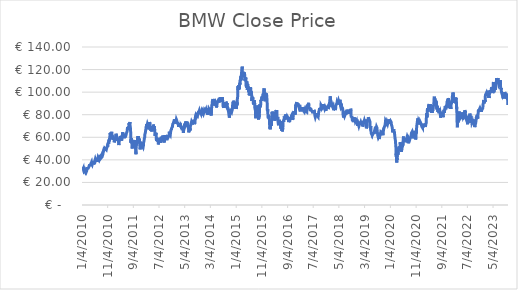
| Category | BMW Close Price |
|---|---|
| 1/4/10 | 32.05 |
| 1/5/10 | 32.31 |
| 1/6/10 | 32.81 |
| 1/7/10 | 33.1 |
| 1/8/10 | 32.655 |
| 1/11/10 | 32.17 |
| 1/12/10 | 31.235 |
| 1/13/10 | 31.425 |
| 1/14/10 | 31.89 |
| 1/15/10 | 31.63 |
| 1/18/10 | 32.1 |
| 1/19/10 | 32.43 |
| 1/20/10 | 31.8 |
| 1/21/10 | 31.155 |
| 1/22/10 | 30.7 |
| 1/25/10 | 30.14 |
| 1/26/10 | 30.255 |
| 1/27/10 | 29.59 |
| 1/28/10 | 29.55 |
| 1/29/10 | 30.96 |
| 2/1/10 | 31.065 |
| 2/2/10 | 31.175 |
| 2/3/10 | 31.225 |
| 2/4/10 | 30.335 |
| 2/5/10 | 29.92 |
| 2/8/10 | 29.61 |
| 2/9/10 | 29.625 |
| 2/10/10 | 29.665 |
| 2/11/10 | 29.49 |
| 2/12/10 | 29 |
| 2/15/10 | 28.65 |
| 2/16/10 | 29.405 |
| 2/17/10 | 29.615 |
| 2/18/10 | 29.415 |
| 2/19/10 | 30.435 |
| 2/22/10 | 30.26 |
| 2/23/10 | 29.69 |
| 2/24/10 | 29.485 |
| 2/25/10 | 29.375 |
| 2/26/10 | 29.785 |
| 3/1/10 | 30.445 |
| 3/2/10 | 31.34 |
| 3/3/10 | 31.65 |
| 3/4/10 | 31.56 |
| 3/5/10 | 32.365 |
| 3/8/10 | 31.99 |
| 3/9/10 | 32.13 |
| 3/10/10 | 32.265 |
| 3/11/10 | 32.69 |
| 3/12/10 | 32.54 |
| 3/15/10 | 32.64 |
| 3/16/10 | 32.755 |
| 3/17/10 | 32.47 |
| 3/18/10 | 32.105 |
| 3/19/10 | 32.06 |
| 3/22/10 | 32.5 |
| 3/23/10 | 33.15 |
| 3/24/10 | 33.375 |
| 3/25/10 | 34.04 |
| 3/26/10 | 34.2 |
| 3/29/10 | 34.115 |
| 3/30/10 | 33.785 |
| 3/31/10 | 34.18 |
| 4/1/10 | 35.155 |
| 4/6/10 | 35.41 |
| 4/7/10 | 34.8 |
| 4/8/10 | 34.53 |
| 4/9/10 | 34.86 |
| 4/12/10 | 35.12 |
| 4/13/10 | 35.35 |
| 4/14/10 | 35.515 |
| 4/15/10 | 35.33 |
| 4/16/10 | 35.56 |
| 4/19/10 | 35.31 |
| 4/20/10 | 36.795 |
| 4/21/10 | 36.58 |
| 4/22/10 | 36.25 |
| 4/23/10 | 37.28 |
| 4/26/10 | 37.82 |
| 4/27/10 | 37.06 |
| 4/28/10 | 36.79 |
| 4/29/10 | 36.775 |
| 4/30/10 | 37.13 |
| 5/3/10 | 37.38 |
| 5/4/10 | 35.84 |
| 5/5/10 | 35.98 |
| 5/6/10 | 36.42 |
| 5/7/10 | 35.48 |
| 5/10/10 | 37.68 |
| 5/11/10 | 38.18 |
| 5/12/10 | 39 |
| 5/13/10 | 39.52 |
| 5/14/10 | 38.62 |
| 5/17/10 | 38.715 |
| 5/18/10 | 39.65 |
| 5/19/10 | 37 |
| 5/20/10 | 36.18 |
| 5/21/10 | 36.025 |
| 5/24/10 | 36.14 |
| 5/25/10 | 35.29 |
| 5/26/10 | 35.76 |
| 5/27/10 | 37.205 |
| 5/28/10 | 37.675 |
| 5/31/10 | 37.965 |
| 6/1/10 | 38.065 |
| 6/2/10 | 38.455 |
| 6/3/10 | 39.22 |
| 6/4/10 | 38.105 |
| 6/7/10 | 38.235 |
| 6/8/10 | 37.68 |
| 6/9/10 | 38.91 |
| 6/10/10 | 40.655 |
| 6/11/10 | 40.085 |
| 6/14/10 | 39.755 |
| 6/15/10 | 39.845 |
| 6/16/10 | 39.03 |
| 6/17/10 | 39.7 |
| 6/18/10 | 40.705 |
| 6/21/10 | 41.8 |
| 6/22/10 | 41.515 |
| 6/23/10 | 41.485 |
| 6/24/10 | 41.36 |
| 6/25/10 | 40.36 |
| 6/28/10 | 41.26 |
| 6/29/10 | 39.9 |
| 6/30/10 | 40.065 |
| 7/1/10 | 38.2 |
| 7/2/10 | 37.885 |
| 7/5/10 | 38.11 |
| 7/6/10 | 39 |
| 7/7/10 | 39.75 |
| 7/8/10 | 38.91 |
| 7/9/10 | 39.15 |
| 7/12/10 | 38.905 |
| 7/13/10 | 42.13 |
| 7/14/10 | 41.545 |
| 7/15/10 | 42.26 |
| 7/16/10 | 42.15 |
| 7/19/10 | 41.355 |
| 7/20/10 | 41.07 |
| 7/21/10 | 40.92 |
| 7/22/10 | 41.965 |
| 7/23/10 | 41.99 |
| 7/26/10 | 42.11 |
| 7/27/10 | 41.5 |
| 7/28/10 | 40.72 |
| 7/29/10 | 40.715 |
| 7/30/10 | 41.31 |
| 8/2/10 | 41.87 |
| 8/3/10 | 43.16 |
| 8/4/10 | 43.68 |
| 8/5/10 | 44.515 |
| 8/6/10 | 43.9 |
| 8/9/10 | 44.305 |
| 8/10/10 | 43.345 |
| 8/11/10 | 42.395 |
| 8/12/10 | 41.9 |
| 8/13/10 | 41.885 |
| 8/16/10 | 41.81 |
| 8/17/10 | 43.1 |
| 8/18/10 | 43.5 |
| 8/19/10 | 42.84 |
| 8/20/10 | 41.87 |
| 8/23/10 | 41.86 |
| 8/24/10 | 41.52 |
| 8/25/10 | 41.435 |
| 8/26/10 | 41.685 |
| 8/27/10 | 41.76 |
| 8/30/10 | 41.205 |
| 8/31/10 | 41.665 |
| 9/1/10 | 42.91 |
| 9/2/10 | 43.595 |
| 9/3/10 | 44.095 |
| 9/6/10 | 44.035 |
| 9/7/10 | 43.935 |
| 9/8/10 | 44.99 |
| 9/9/10 | 45.4 |
| 9/10/10 | 46.205 |
| 9/13/10 | 46.435 |
| 9/14/10 | 47.12 |
| 9/15/10 | 47.25 |
| 9/16/10 | 47.35 |
| 9/17/10 | 47.41 |
| 9/20/10 | 49.125 |
| 9/21/10 | 48.48 |
| 9/22/10 | 48.08 |
| 9/23/10 | 48.295 |
| 9/24/10 | 50.35 |
| 9/27/10 | 50.15 |
| 9/28/10 | 50.67 |
| 9/29/10 | 51.06 |
| 9/30/10 | 51.44 |
| 10/1/10 | 49.3 |
| 10/4/10 | 48.22 |
| 10/5/10 | 49.955 |
| 10/6/10 | 49.495 |
| 10/7/10 | 50 |
| 10/8/10 | 50.07 |
| 10/11/10 | 49.87 |
| 10/12/10 | 50.2 |
| 10/13/10 | 50.07 |
| 10/14/10 | 50 |
| 10/15/10 | 49.45 |
| 10/18/10 | 49 |
| 10/19/10 | 49.115 |
| 10/20/10 | 49.6 |
| 10/21/10 | 50.02 |
| 10/22/10 | 50.03 |
| 10/25/10 | 50.72 |
| 10/26/10 | 50.44 |
| 10/27/10 | 49.875 |
| 10/28/10 | 49.845 |
| 10/29/10 | 51.51 |
| 11/1/10 | 52.96 |
| 11/2/10 | 52.35 |
| 11/3/10 | 51.64 |
| 11/4/10 | 54.08 |
| 11/5/10 | 54.06 |
| 11/8/10 | 53.41 |
| 11/9/10 | 54.91 |
| 11/10/10 | 53.75 |
| 11/11/10 | 54.42 |
| 11/12/10 | 55.29 |
| 11/15/10 | 56.06 |
| 11/16/10 | 54.62 |
| 11/17/10 | 54.3 |
| 11/18/10 | 56.3 |
| 11/19/10 | 56.67 |
| 11/22/10 | 57.69 |
| 11/23/10 | 56.47 |
| 11/24/10 | 59.12 |
| 11/25/10 | 59.9 |
| 11/26/10 | 59.25 |
| 11/29/10 | 57.74 |
| 11/30/10 | 57.93 |
| 12/1/10 | 60.9 |
| 12/2/10 | 63.8 |
| 12/3/10 | 63.69 |
| 12/6/10 | 62.81 |
| 12/7/10 | 63.98 |
| 12/8/10 | 61.9 |
| 12/9/10 | 60.2 |
| 12/10/10 | 62.52 |
| 12/13/10 | 63.44 |
| 12/14/10 | 62.47 |
| 12/15/10 | 62.49 |
| 12/16/10 | 62.8 |
| 12/17/10 | 61.95 |
| 12/20/10 | 63.15 |
| 12/21/10 | 64.8 |
| 12/22/10 | 64.37 |
| 12/23/10 | 63.26 |
| 12/27/10 | 59.22 |
| 12/28/10 | 58.25 |
| 12/29/10 | 58.72 |
| 12/30/10 | 58.85 |
| 1/3/11 | 61.45 |
| 1/4/11 | 60.74 |
| 1/5/11 | 60.03 |
| 1/6/11 | 59.9 |
| 1/7/11 | 59.31 |
| 1/10/11 | 58.47 |
| 1/11/11 | 59.66 |
| 1/12/11 | 59.32 |
| 1/13/11 | 57.68 |
| 1/14/11 | 58.94 |
| 1/17/11 | 58.55 |
| 1/18/11 | 58.75 |
| 1/19/11 | 57.86 |
| 1/20/11 | 55.51 |
| 1/21/11 | 55.7 |
| 1/24/11 | 55.23 |
| 1/25/11 | 56.08 |
| 1/26/11 | 56.95 |
| 1/27/11 | 57.31 |
| 1/28/11 | 57.1 |
| 1/31/11 | 56.08 |
| 2/1/11 | 56.51 |
| 2/2/11 | 56.47 |
| 2/3/11 | 57.33 |
| 2/4/11 | 56.85 |
| 2/7/11 | 58.85 |
| 2/8/11 | 61.59 |
| 2/9/11 | 61.29 |
| 2/10/11 | 61.71 |
| 2/11/11 | 63.14 |
| 2/14/11 | 63.14 |
| 2/15/11 | 61.98 |
| 2/16/11 | 61.66 |
| 2/17/11 | 61.04 |
| 2/18/11 | 60.56 |
| 2/21/11 | 60.3 |
| 2/22/11 | 60.43 |
| 2/23/11 | 58.3 |
| 2/24/11 | 57 |
| 2/25/11 | 58.7 |
| 2/28/11 | 58.78 |
| 3/1/11 | 59.67 |
| 3/2/11 | 58 |
| 3/3/11 | 58.09 |
| 3/4/11 | 57.78 |
| 3/7/11 | 57.74 |
| 3/8/11 | 57.97 |
| 3/9/11 | 58.14 |
| 3/10/11 | 57.12 |
| 3/11/11 | 56.3 |
| 3/14/11 | 55.8 |
| 3/15/11 | 54.29 |
| 3/16/11 | 53.09 |
| 3/17/11 | 54.13 |
| 3/18/11 | 55.3 |
| 3/21/11 | 55.44 |
| 3/22/11 | 54.59 |
| 3/23/11 | 55.27 |
| 3/24/11 | 57.6 |
| 3/25/11 | 57.46 |
| 3/28/11 | 57.36 |
| 3/29/11 | 57.39 |
| 3/30/11 | 58.56 |
| 3/31/11 | 58.75 |
| 4/1/11 | 61.22 |
| 4/4/11 | 60.41 |
| 4/5/11 | 61 |
| 4/6/11 | 60.81 |
| 4/7/11 | 59.13 |
| 4/8/11 | 58.54 |
| 4/11/11 | 57.1 |
| 4/12/11 | 56.64 |
| 4/13/11 | 57.59 |
| 4/14/11 | 57.94 |
| 4/15/11 | 58.12 |
| 4/18/11 | 57.21 |
| 4/19/11 | 58.79 |
| 4/20/11 | 60.53 |
| 4/21/11 | 61 |
| 4/26/11 | 61.71 |
| 4/27/11 | 61.94 |
| 4/28/11 | 63.18 |
| 4/29/11 | 63.67 |
| 5/2/11 | 64.44 |
| 5/3/11 | 63.37 |
| 5/4/11 | 62.35 |
| 5/5/11 | 61.36 |
| 5/6/11 | 62.82 |
| 5/9/11 | 61.28 |
| 5/10/11 | 62.67 |
| 5/11/11 | 63.17 |
| 5/12/11 | 63.21 |
| 5/13/11 | 61.86 |
| 5/16/11 | 61.54 |
| 5/17/11 | 60.57 |
| 5/18/11 | 61.25 |
| 5/19/11 | 61.98 |
| 5/20/11 | 60.98 |
| 5/23/11 | 59.13 |
| 5/24/11 | 60.28 |
| 5/25/11 | 60.75 |
| 5/26/11 | 59.7 |
| 5/27/11 | 60.7 |
| 5/30/11 | 60.83 |
| 5/31/11 | 61.48 |
| 6/1/11 | 60.61 |
| 6/2/11 | 60.14 |
| 6/3/11 | 60.29 |
| 6/6/11 | 60.74 |
| 6/7/11 | 60.32 |
| 6/8/11 | 61 |
| 6/9/11 | 62.93 |
| 6/10/11 | 62.34 |
| 6/13/11 | 62.51 |
| 6/14/11 | 63.4 |
| 6/15/11 | 62.38 |
| 6/16/11 | 63.44 |
| 6/17/11 | 64.18 |
| 6/20/11 | 63.9 |
| 6/21/11 | 64.85 |
| 6/22/11 | 65.39 |
| 6/23/11 | 65.21 |
| 6/24/11 | 67.13 |
| 6/27/11 | 67.76 |
| 6/28/11 | 69.1 |
| 6/29/11 | 68.86 |
| 6/30/11 | 68.81 |
| 7/1/11 | 67.77 |
| 7/4/11 | 68.82 |
| 7/5/11 | 68.79 |
| 7/6/11 | 67.82 |
| 7/7/11 | 69.28 |
| 7/8/11 | 68.51 |
| 7/11/11 | 66.75 |
| 7/12/11 | 67.24 |
| 7/13/11 | 70.18 |
| 7/14/11 | 71 |
| 7/15/11 | 72.67 |
| 7/18/11 | 71.11 |
| 7/19/11 | 72 |
| 7/20/11 | 71.95 |
| 7/21/11 | 71.19 |
| 7/22/11 | 71.58 |
| 7/25/11 | 73.52 |
| 7/26/11 | 72.19 |
| 7/27/11 | 70.7 |
| 7/28/11 | 70.25 |
| 7/29/11 | 69.82 |
| 8/1/11 | 67.71 |
| 8/2/11 | 65.97 |
| 8/3/11 | 65.55 |
| 8/4/11 | 61.27 |
| 8/5/11 | 60.48 |
| 8/8/11 | 55.14 |
| 8/9/11 | 58.63 |
| 8/10/11 | 55.62 |
| 8/11/11 | 57.66 |
| 8/12/11 | 59.34 |
| 8/15/11 | 59.31 |
| 8/16/11 | 58.87 |
| 8/17/11 | 58.76 |
| 8/18/11 | 54.15 |
| 8/19/11 | 52.3 |
| 8/22/11 | 50.09 |
| 8/23/11 | 51.37 |
| 8/24/11 | 53.57 |
| 8/25/11 | 53.82 |
| 8/26/11 | 54.05 |
| 8/29/11 | 54.41 |
| 8/30/11 | 54.25 |
| 8/31/11 | 56.35 |
| 9/1/11 | 56.9 |
| 9/2/11 | 54.22 |
| 9/5/11 | 50.87 |
| 9/6/11 | 50.66 |
| 9/7/11 | 53.71 |
| 9/8/11 | 53.3 |
| 9/9/11 | 51.69 |
| 9/12/11 | 50.9 |
| 9/13/11 | 51.95 |
| 9/14/11 | 55.07 |
| 9/15/11 | 56.52 |
| 9/16/11 | 57.18 |
| 9/19/11 | 56.2 |
| 9/20/11 | 57.64 |
| 9/21/11 | 56.09 |
| 9/22/11 | 52.99 |
| 9/23/11 | 52.18 |
| 9/26/11 | 50.8 |
| 9/27/11 | 53.95 |
| 9/28/11 | 53.25 |
| 9/29/11 | 52.75 |
| 9/30/11 | 49.965 |
| 10/4/11 | 45.04 |
| 10/5/11 | 47.395 |
| 10/6/11 | 48.905 |
| 10/7/11 | 50.89 |
| 10/10/11 | 52.99 |
| 10/11/11 | 53.75 |
| 10/12/11 | 54.91 |
| 10/13/11 | 54.82 |
| 10/14/11 | 56.44 |
| 10/17/11 | 54.5 |
| 10/18/11 | 55.08 |
| 10/19/11 | 55.01 |
| 10/20/11 | 54.11 |
| 10/21/11 | 57.19 |
| 10/24/11 | 57.88 |
| 10/25/11 | 57.8 |
| 10/26/11 | 57.81 |
| 10/27/11 | 61.06 |
| 10/28/11 | 61.81 |
| 10/31/11 | 59.06 |
| 11/1/11 | 56.58 |
| 11/2/11 | 57.97 |
| 11/3/11 | 60.61 |
| 11/4/11 | 57.86 |
| 11/7/11 | 58.13 |
| 11/8/11 | 58.42 |
| 11/9/11 | 56.84 |
| 11/10/11 | 57.61 |
| 11/11/11 | 58.73 |
| 11/14/11 | 58.16 |
| 11/15/11 | 57.55 |
| 11/16/11 | 55.71 |
| 11/17/11 | 54.49 |
| 11/18/11 | 53.55 |
| 11/21/11 | 51.33 |
| 11/22/11 | 50.84 |
| 11/23/11 | 49.3 |
| 11/24/11 | 49.78 |
| 11/25/11 | 50.32 |
| 11/28/11 | 52.94 |
| 11/29/11 | 52.92 |
| 11/30/11 | 55.98 |
| 12/1/11 | 55.18 |
| 12/2/11 | 55.61 |
| 12/5/11 | 56.21 |
| 12/6/11 | 56.07 |
| 12/7/11 | 55.67 |
| 12/8/11 | 53.61 |
| 12/9/11 | 53.8 |
| 12/12/11 | 52.52 |
| 12/13/11 | 52.95 |
| 12/14/11 | 50.25 |
| 12/15/11 | 50.74 |
| 12/16/11 | 49.99 |
| 12/19/11 | 50.07 |
| 12/20/11 | 52.22 |
| 12/21/11 | 52.53 |
| 12/22/11 | 52.74 |
| 12/23/11 | 52.5 |
| 12/27/11 | 52.82 |
| 12/28/11 | 51.1 |
| 12/29/11 | 51.36 |
| 12/30/11 | 51.76 |
| 1/2/12 | 53.16 |
| 1/3/12 | 55.29 |
| 1/4/12 | 55.87 |
| 1/5/12 | 56.15 |
| 1/6/12 | 55.55 |
| 1/9/12 | 56.84 |
| 1/10/12 | 58.72 |
| 1/11/12 | 58.93 |
| 1/12/12 | 59.4 |
| 1/13/12 | 58.45 |
| 1/16/12 | 59.96 |
| 1/17/12 | 62.04 |
| 1/18/12 | 62.23 |
| 1/19/12 | 62.96 |
| 1/20/12 | 63.59 |
| 1/23/12 | 63.88 |
| 1/24/12 | 63.5 |
| 1/25/12 | 63.59 |
| 1/26/12 | 65.4 |
| 1/27/12 | 64.6 |
| 1/30/12 | 64.55 |
| 1/31/12 | 65.39 |
| 2/1/12 | 67.99 |
| 2/2/12 | 68 |
| 2/3/12 | 69.98 |
| 2/6/12 | 70.76 |
| 2/7/12 | 69.36 |
| 2/8/12 | 69 |
| 2/9/12 | 71.54 |
| 2/10/12 | 69.87 |
| 2/13/12 | 70.56 |
| 2/14/12 | 70.02 |
| 2/15/12 | 70.23 |
| 2/16/12 | 70.4 |
| 2/17/12 | 71.98 |
| 2/20/12 | 72.24 |
| 2/21/12 | 71.9 |
| 2/22/12 | 70.95 |
| 2/23/12 | 69.89 |
| 2/24/12 | 70.32 |
| 2/27/12 | 69.04 |
| 2/28/12 | 69.88 |
| 2/29/12 | 69.43 |
| 3/1/12 | 71.49 |
| 3/2/12 | 70.61 |
| 3/5/12 | 70.63 |
| 3/6/12 | 67.02 |
| 3/7/12 | 68.27 |
| 3/8/12 | 69.2 |
| 3/9/12 | 70.5 |
| 3/12/12 | 71.05 |
| 3/13/12 | 70.74 |
| 3/14/12 | 73.45 |
| 3/15/12 | 73.76 |
| 3/16/12 | 73.02 |
| 3/19/12 | 71.84 |
| 3/20/12 | 68.22 |
| 3/21/12 | 68.81 |
| 3/22/12 | 67.61 |
| 3/23/12 | 67.9 |
| 3/26/12 | 68.67 |
| 3/27/12 | 68.45 |
| 3/28/12 | 67.22 |
| 3/29/12 | 65.83 |
| 3/30/12 | 67.43 |
| 4/2/12 | 69.21 |
| 4/3/12 | 67.99 |
| 4/4/12 | 66.56 |
| 4/5/12 | 66.78 |
| 4/10/12 | 65.08 |
| 4/11/12 | 66.71 |
| 4/12/12 | 68.65 |
| 4/13/12 | 67.5 |
| 4/16/12 | 68.71 |
| 4/17/12 | 70 |
| 4/18/12 | 69.44 |
| 4/19/12 | 68.32 |
| 4/20/12 | 69.84 |
| 4/23/12 | 67 |
| 4/24/12 | 67.6 |
| 4/25/12 | 69.68 |
| 4/26/12 | 71.25 |
| 4/27/12 | 72.13 |
| 4/30/12 | 71.81 |
| 5/2/12 | 71.07 |
| 5/3/12 | 71.68 |
| 5/4/12 | 68.99 |
| 5/7/12 | 70.05 |
| 5/8/12 | 67.35 |
| 5/9/12 | 67.7 |
| 5/10/12 | 66.24 |
| 5/11/12 | 67.6 |
| 5/14/12 | 66.44 |
| 5/15/12 | 66.17 |
| 5/16/12 | 66.53 |
| 5/17/12 | 62.73 |
| 5/18/12 | 61.31 |
| 5/21/12 | 61.77 |
| 5/22/12 | 63.43 |
| 5/23/12 | 61.81 |
| 5/24/12 | 61.98 |
| 5/25/12 | 61.9 |
| 5/28/12 | 62.28 |
| 5/29/12 | 64 |
| 5/30/12 | 62.01 |
| 5/31/12 | 61.1 |
| 6/1/12 | 58.72 |
| 6/4/12 | 56.85 |
| 6/5/12 | 57.2 |
| 6/6/12 | 58.51 |
| 6/7/12 | 59.58 |
| 6/8/12 | 58.82 |
| 6/11/12 | 58.77 |
| 6/12/12 | 58.58 |
| 6/13/12 | 57.81 |
| 6/14/12 | 56.29 |
| 6/15/12 | 55.96 |
| 6/18/12 | 57.14 |
| 6/19/12 | 57.93 |
| 6/20/12 | 58.07 |
| 6/21/12 | 57.58 |
| 6/22/12 | 56.47 |
| 6/25/12 | 54.94 |
| 6/26/12 | 53.7 |
| 6/27/12 | 54.52 |
| 6/28/12 | 54.16 |
| 6/29/12 | 56.93 |
| 7/2/12 | 57.41 |
| 7/3/12 | 58.94 |
| 7/4/12 | 58.95 |
| 7/5/12 | 59.11 |
| 7/6/12 | 56.42 |
| 7/9/12 | 56.39 |
| 7/10/12 | 57.25 |
| 7/11/12 | 56.69 |
| 7/12/12 | 55.84 |
| 7/13/12 | 57.77 |
| 7/16/12 | 57.5 |
| 7/17/12 | 57.62 |
| 7/18/12 | 58.84 |
| 7/19/12 | 59.66 |
| 7/20/12 | 58.28 |
| 7/23/12 | 56.64 |
| 7/24/12 | 55.18 |
| 7/25/12 | 55.89 |
| 7/26/12 | 57.5 |
| 7/27/12 | 59.15 |
| 7/30/12 | 60.43 |
| 7/31/12 | 60.77 |
| 8/1/12 | 58.99 |
| 8/2/12 | 56.46 |
| 8/3/12 | 58.12 |
| 8/6/12 | 59.5 |
| 8/7/12 | 60.51 |
| 8/8/12 | 60.22 |
| 8/9/12 | 60.17 |
| 8/10/12 | 59.9 |
| 8/13/12 | 59.08 |
| 8/14/12 | 59.13 |
| 8/15/12 | 58.98 |
| 8/16/12 | 59.95 |
| 8/17/12 | 61.46 |
| 8/20/12 | 61.22 |
| 8/21/12 | 61.64 |
| 8/22/12 | 61.39 |
| 8/23/12 | 60.81 |
| 8/24/12 | 60.05 |
| 8/27/12 | 60.77 |
| 8/28/12 | 60.53 |
| 8/29/12 | 60.21 |
| 8/30/12 | 57.35 |
| 8/31/12 | 57.66 |
| 9/3/12 | 57.15 |
| 9/4/12 | 55.39 |
| 9/5/12 | 55.05 |
| 9/6/12 | 57.23 |
| 9/7/12 | 58.03 |
| 9/10/12 | 58.53 |
| 9/11/12 | 59.38 |
| 9/12/12 | 60.56 |
| 9/13/12 | 59.97 |
| 9/14/12 | 62 |
| 9/17/12 | 61.69 |
| 9/18/12 | 60.45 |
| 9/19/12 | 61.19 |
| 9/20/12 | 59.44 |
| 9/21/12 | 59.79 |
| 9/24/12 | 59.64 |
| 9/25/12 | 58.81 |
| 9/26/12 | 57.62 |
| 9/27/12 | 57.64 |
| 9/28/12 | 56.91 |
| 10/1/12 | 57.14 |
| 10/2/12 | 57.73 |
| 10/4/12 | 59.76 |
| 10/5/12 | 60.99 |
| 10/8/12 | 60.05 |
| 10/9/12 | 59.99 |
| 10/10/12 | 59.55 |
| 10/11/12 | 60.84 |
| 10/12/12 | 60.4 |
| 10/15/12 | 60.46 |
| 10/16/12 | 60.99 |
| 10/17/12 | 61.66 |
| 10/18/12 | 62.04 |
| 10/19/12 | 62.01 |
| 10/22/12 | 61.48 |
| 10/23/12 | 60.46 |
| 10/24/12 | 60.35 |
| 10/25/12 | 60.34 |
| 10/26/12 | 60.97 |
| 10/29/12 | 60.49 |
| 10/30/12 | 61.51 |
| 10/31/12 | 61.45 |
| 11/1/12 | 63.32 |
| 11/2/12 | 65 |
| 11/5/12 | 64.49 |
| 11/6/12 | 64.05 |
| 11/7/12 | 64.42 |
| 11/8/12 | 63.69 |
| 11/9/12 | 64.23 |
| 11/12/12 | 63.66 |
| 11/13/12 | 63.62 |
| 11/14/12 | 63.23 |
| 11/15/12 | 62.6 |
| 11/16/12 | 61.99 |
| 11/19/12 | 65.11 |
| 11/20/12 | 65.7 |
| 11/21/12 | 66.14 |
| 11/22/12 | 65.66 |
| 11/23/12 | 65.78 |
| 11/26/12 | 66.23 |
| 11/27/12 | 66.56 |
| 11/28/12 | 67.04 |
| 11/29/12 | 67.91 |
| 11/30/12 | 68.19 |
| 12/3/12 | 67.9 |
| 12/4/12 | 67.69 |
| 12/5/12 | 67.93 |
| 12/6/12 | 68.66 |
| 12/7/12 | 69.04 |
| 12/10/12 | 69.33 |
| 12/11/12 | 70.59 |
| 12/12/12 | 70.98 |
| 12/13/12 | 70.79 |
| 12/14/12 | 71.73 |
| 12/17/12 | 71.68 |
| 12/18/12 | 72 |
| 12/19/12 | 72.02 |
| 12/20/12 | 72.17 |
| 12/21/12 | 72.7 |
| 12/27/12 | 73.46 |
| 12/28/12 | 72.93 |
| 1/2/13 | 75.93 |
| 1/3/13 | 75.61 |
| 1/4/13 | 75.8 |
| 1/7/13 | 75.75 |
| 1/8/13 | 73.21 |
| 1/9/13 | 72.16 |
| 1/10/13 | 72.89 |
| 1/11/13 | 73.22 |
| 1/14/13 | 73.22 |
| 1/15/13 | 72.48 |
| 1/16/13 | 73.1 |
| 1/17/13 | 74.06 |
| 1/18/13 | 73.33 |
| 1/21/13 | 74.28 |
| 1/22/13 | 74.16 |
| 1/23/13 | 74.34 |
| 1/24/13 | 74.63 |
| 1/25/13 | 75.85 |
| 1/28/13 | 75.5 |
| 1/29/13 | 75.58 |
| 1/30/13 | 74.91 |
| 1/31/13 | 74.15 |
| 2/1/13 | 74.48 |
| 2/4/13 | 72.03 |
| 2/5/13 | 71.86 |
| 2/6/13 | 71.77 |
| 2/7/13 | 71.74 |
| 2/8/13 | 73.5 |
| 2/11/13 | 72.07 |
| 2/12/13 | 71.52 |
| 2/13/13 | 72.15 |
| 2/14/13 | 71.68 |
| 2/15/13 | 71.65 |
| 2/18/13 | 71.37 |
| 2/19/13 | 71.79 |
| 2/20/13 | 70.76 |
| 2/21/13 | 69.06 |
| 2/22/13 | 68.79 |
| 2/25/13 | 70.58 |
| 2/26/13 | 69.46 |
| 2/27/13 | 70.32 |
| 2/28/13 | 70.7 |
| 3/1/13 | 69.2 |
| 3/4/13 | 69.4 |
| 3/5/13 | 71.41 |
| 3/6/13 | 71.6 |
| 3/7/13 | 72.02 |
| 3/8/13 | 72.65 |
| 3/11/13 | 72.56 |
| 3/12/13 | 72 |
| 3/13/13 | 71.27 |
| 3/14/13 | 70.94 |
| 3/15/13 | 70 |
| 3/18/13 | 70.19 |
| 3/19/13 | 69.07 |
| 3/20/13 | 70.15 |
| 3/21/13 | 69.36 |
| 3/22/13 | 69.59 |
| 3/25/13 | 69.75 |
| 3/26/13 | 69.81 |
| 3/27/13 | 69.1 |
| 3/28/13 | 67.31 |
| 4/2/13 | 68.35 |
| 4/3/13 | 68.39 |
| 4/4/13 | 67.57 |
| 4/5/13 | 66.31 |
| 4/8/13 | 66.3 |
| 4/9/13 | 65.9 |
| 4/10/13 | 67.95 |
| 4/11/13 | 69.03 |
| 4/12/13 | 67.4 |
| 4/15/13 | 66.44 |
| 4/16/13 | 66.86 |
| 4/17/13 | 65 |
| 4/18/13 | 63.93 |
| 4/19/13 | 64.84 |
| 4/22/13 | 65.24 |
| 4/23/13 | 66.78 |
| 4/24/13 | 67.84 |
| 4/25/13 | 68.89 |
| 4/26/13 | 68.62 |
| 4/29/13 | 69.86 |
| 4/30/13 | 70.05 |
| 5/2/13 | 70.74 |
| 5/3/13 | 72.12 |
| 5/6/13 | 71.33 |
| 5/7/13 | 70.98 |
| 5/8/13 | 71.03 |
| 5/9/13 | 71.07 |
| 5/10/13 | 71.84 |
| 5/13/13 | 72.08 |
| 5/14/13 | 73.31 |
| 5/15/13 | 71.93 |
| 5/16/13 | 71.4 |
| 5/17/13 | 71.93 |
| 5/20/13 | 74.02 |
| 5/21/13 | 73.83 |
| 5/22/13 | 73.35 |
| 5/23/13 | 71.48 |
| 5/24/13 | 70.88 |
| 5/27/13 | 71.88 |
| 5/28/13 | 72.31 |
| 5/29/13 | 72.42 |
| 5/30/13 | 73.15 |
| 5/31/13 | 73.69 |
| 6/3/13 | 73.11 |
| 6/4/13 | 73.3 |
| 6/5/13 | 72.38 |
| 6/6/13 | 71.05 |
| 6/7/13 | 72.2 |
| 6/10/13 | 72.49 |
| 6/11/13 | 71.41 |
| 6/12/13 | 70.16 |
| 6/13/13 | 69.16 |
| 6/14/13 | 70.03 |
| 6/17/13 | 70.55 |
| 6/18/13 | 69.87 |
| 6/19/13 | 69.8 |
| 6/20/13 | 66.43 |
| 6/21/13 | 64.36 |
| 6/24/13 | 64.04 |
| 6/25/13 | 65.92 |
| 6/26/13 | 66.77 |
| 6/27/13 | 67.29 |
| 6/28/13 | 67.18 |
| 7/1/13 | 67.28 |
| 7/2/13 | 66.43 |
| 7/3/13 | 66.12 |
| 7/4/13 | 67.7 |
| 7/5/13 | 66.2 |
| 7/8/13 | 67.9 |
| 7/9/13 | 69.03 |
| 7/10/13 | 69 |
| 7/11/13 | 70.15 |
| 7/12/13 | 70.52 |
| 7/15/13 | 70.86 |
| 7/16/13 | 71.1 |
| 7/17/13 | 71.27 |
| 7/18/13 | 72.02 |
| 7/19/13 | 72.23 |
| 7/22/13 | 72.13 |
| 7/23/13 | 72.4 |
| 7/24/13 | 73.86 |
| 7/25/13 | 74.04 |
| 7/26/13 | 74.16 |
| 7/29/13 | 73.97 |
| 7/30/13 | 74.45 |
| 7/31/13 | 73.59 |
| 8/1/13 | 73.01 |
| 8/2/13 | 72.48 |
| 8/5/13 | 72.18 |
| 8/6/13 | 71.37 |
| 8/7/13 | 70.64 |
| 8/8/13 | 71.68 |
| 8/9/13 | 72.3 |
| 8/12/13 | 73.16 |
| 8/13/13 | 73.97 |
| 8/14/13 | 74.4 |
| 8/15/13 | 74.36 |
| 8/16/13 | 75.53 |
| 8/19/13 | 75.03 |
| 8/20/13 | 74.05 |
| 8/21/13 | 73.7 |
| 8/22/13 | 75.18 |
| 8/23/13 | 75.4 |
| 8/26/13 | 75.42 |
| 8/27/13 | 73 |
| 8/28/13 | 71.75 |
| 8/29/13 | 72.41 |
| 8/30/13 | 71.29 |
| 9/2/13 | 72.76 |
| 9/3/13 | 72.23 |
| 9/4/13 | 72.59 |
| 9/5/13 | 76.97 |
| 9/6/13 | 77.7 |
| 9/9/13 | 78.17 |
| 9/10/13 | 79.14 |
| 9/11/13 | 80 |
| 9/12/13 | 79.55 |
| 9/13/13 | 79.9 |
| 9/16/13 | 80.58 |
| 9/17/13 | 80.18 |
| 9/18/13 | 80.05 |
| 9/19/13 | 81.44 |
| 9/20/13 | 80.47 |
| 9/23/13 | 80.31 |
| 9/24/13 | 80.8 |
| 9/25/13 | 80.37 |
| 9/26/13 | 79.72 |
| 9/27/13 | 80.1 |
| 9/30/13 | 79.47 |
| 10/1/13 | 80.91 |
| 10/2/13 | 79.3 |
| 10/4/13 | 79.68 |
| 10/7/13 | 79.17 |
| 10/8/13 | 78.62 |
| 10/9/13 | 78.8 |
| 10/10/13 | 80.38 |
| 10/11/13 | 80.74 |
| 10/14/13 | 80.63 |
| 10/15/13 | 82.95 |
| 10/16/13 | 82.2 |
| 10/17/13 | 81.94 |
| 10/18/13 | 82.03 |
| 10/21/13 | 82.1 |
| 10/22/13 | 81.85 |
| 10/23/13 | 82 |
| 10/24/13 | 83.56 |
| 10/25/13 | 83.66 |
| 10/28/13 | 82.39 |
| 10/29/13 | 82.21 |
| 10/30/13 | 82.69 |
| 10/31/13 | 83.54 |
| 11/1/13 | 82.68 |
| 11/4/13 | 83.6 |
| 11/5/13 | 81.2 |
| 11/6/13 | 82.16 |
| 11/7/13 | 81.82 |
| 11/8/13 | 81.77 |
| 11/11/13 | 82.07 |
| 11/12/13 | 81.54 |
| 11/13/13 | 80.96 |
| 11/14/13 | 81.6 |
| 11/15/13 | 81.55 |
| 11/18/13 | 83.2 |
| 11/19/13 | 83.02 |
| 11/20/13 | 83.28 |
| 11/21/13 | 83.14 |
| 11/22/13 | 83.77 |
| 11/25/13 | 84.57 |
| 11/26/13 | 84.32 |
| 11/27/13 | 84.8 |
| 11/28/13 | 84.73 |
| 11/29/13 | 84.57 |
| 12/2/13 | 85.11 |
| 12/3/13 | 83.52 |
| 12/4/13 | 82.54 |
| 12/5/13 | 81.58 |
| 12/6/13 | 82.14 |
| 12/9/13 | 82.11 |
| 12/10/13 | 81.05 |
| 12/11/13 | 80.58 |
| 12/12/13 | 79.78 |
| 12/13/13 | 79.79 |
| 12/16/13 | 80.92 |
| 12/17/13 | 80.44 |
| 12/18/13 | 82.14 |
| 12/19/13 | 83.39 |
| 12/20/13 | 83.99 |
| 12/23/13 | 84.55 |
| 12/27/13 | 85.42 |
| 12/30/13 | 85.22 |
| 1/2/14 | 83.54 |
| 1/3/14 | 83.98 |
| 1/6/14 | 82.99 |
| 1/7/14 | 83.55 |
| 1/8/14 | 84.45 |
| 1/9/14 | 83.86 |
| 1/10/14 | 83.15 |
| 1/13/14 | 84.15 |
| 1/14/14 | 84.12 |
| 1/15/14 | 84.96 |
| 1/16/14 | 85.5 |
| 1/17/14 | 86.21 |
| 1/20/14 | 86.13 |
| 1/21/14 | 85.93 |
| 1/22/14 | 85.73 |
| 1/23/14 | 84.64 |
| 1/24/14 | 81.97 |
| 1/27/14 | 80.44 |
| 1/28/14 | 81.53 |
| 1/29/14 | 80.83 |
| 1/30/14 | 80.82 |
| 1/31/14 | 80.82 |
| 2/3/14 | 79.99 |
| 2/4/14 | 80.29 |
| 2/5/14 | 79.88 |
| 2/6/14 | 81.44 |
| 2/7/14 | 81.8 |
| 2/10/14 | 82 |
| 2/11/14 | 84.45 |
| 2/12/14 | 84.97 |
| 2/13/14 | 85.36 |
| 2/14/14 | 86 |
| 2/17/14 | 84.93 |
| 2/18/14 | 84.62 |
| 2/19/14 | 85 |
| 2/20/14 | 84.43 |
| 2/21/14 | 85.22 |
| 2/24/14 | 84.59 |
| 2/25/14 | 83.95 |
| 2/26/14 | 84.31 |
| 2/27/14 | 83.8 |
| 2/28/14 | 84.2 |
| 3/3/14 | 81.65 |
| 3/4/14 | 82.78 |
| 3/5/14 | 82.48 |
| 3/6/14 | 83.08 |
| 3/7/14 | 81.86 |
| 3/10/14 | 80.52 |
| 3/11/14 | 81.21 |
| 3/12/14 | 80.24 |
| 3/13/14 | 80.12 |
| 3/14/14 | 79.26 |
| 3/17/14 | 80.08 |
| 3/18/14 | 80.08 |
| 3/19/14 | 86.6 |
| 3/20/14 | 87.3 |
| 3/21/14 | 88.4 |
| 3/24/14 | 88.06 |
| 3/25/14 | 89.45 |
| 3/26/14 | 90.6 |
| 3/27/14 | 91.28 |
| 3/28/14 | 92.23 |
| 3/31/14 | 91.62 |
| 4/1/14 | 92.09 |
| 4/2/14 | 92.65 |
| 4/3/14 | 93.04 |
| 4/4/14 | 93.85 |
| 4/7/14 | 91.83 |
| 4/8/14 | 91.42 |
| 4/9/14 | 91.29 |
| 4/10/14 | 90.51 |
| 4/11/14 | 90.21 |
| 4/14/14 | 90.14 |
| 4/15/14 | 88.19 |
| 4/16/14 | 90.41 |
| 4/17/14 | 92.12 |
| 4/22/14 | 94.02 |
| 4/23/14 | 92.68 |
| 4/24/14 | 91.46 |
| 4/25/14 | 89.56 |
| 4/28/14 | 89.84 |
| 4/29/14 | 90.34 |
| 4/30/14 | 90.18 |
| 5/2/14 | 89.03 |
| 5/5/14 | 88.75 |
| 5/6/14 | 88.44 |
| 5/7/14 | 88.19 |
| 5/8/14 | 88.3 |
| 5/9/14 | 88.12 |
| 5/12/14 | 88.7 |
| 5/13/14 | 89.45 |
| 5/14/14 | 89.25 |
| 5/15/14 | 88.11 |
| 5/16/14 | 86.43 |
| 5/19/14 | 88.18 |
| 5/20/14 | 88 |
| 5/21/14 | 88.7 |
| 5/22/14 | 89.34 |
| 5/23/14 | 89.88 |
| 5/26/14 | 91.27 |
| 5/27/14 | 91.77 |
| 5/28/14 | 91.36 |
| 5/29/14 | 92.13 |
| 5/30/14 | 92.09 |
| 6/2/14 | 91.48 |
| 6/3/14 | 92.02 |
| 6/4/14 | 91.27 |
| 6/5/14 | 92.76 |
| 6/6/14 | 92.88 |
| 6/9/14 | 92.58 |
| 6/10/14 | 92.02 |
| 6/11/14 | 91.74 |
| 6/12/14 | 91.36 |
| 6/13/14 | 90.76 |
| 6/16/14 | 90.93 |
| 6/17/14 | 90.75 |
| 6/18/14 | 91.41 |
| 6/19/14 | 92.67 |
| 6/20/14 | 92.56 |
| 6/23/14 | 91.5 |
| 6/24/14 | 94.1 |
| 6/25/14 | 93.09 |
| 6/26/14 | 92.48 |
| 6/27/14 | 92.36 |
| 6/30/14 | 92.62 |
| 7/1/14 | 93.3 |
| 7/2/14 | 93.88 |
| 7/3/14 | 95.32 |
| 7/4/14 | 95.15 |
| 7/7/14 | 93.91 |
| 7/8/14 | 92.7 |
| 7/9/14 | 92.72 |
| 7/10/14 | 91.42 |
| 7/11/14 | 92.07 |
| 7/14/14 | 92.83 |
| 7/15/14 | 92.48 |
| 7/16/14 | 95.25 |
| 7/17/14 | 94.47 |
| 7/18/14 | 93.61 |
| 7/21/14 | 92.48 |
| 7/22/14 | 93.97 |
| 7/23/14 | 94.46 |
| 7/24/14 | 95.51 |
| 7/25/14 | 94.3 |
| 7/28/14 | 92.21 |
| 7/29/14 | 91.53 |
| 7/30/14 | 90.97 |
| 7/31/14 | 89.34 |
| 8/1/14 | 87.63 |
| 8/4/14 | 88.41 |
| 8/5/14 | 88.5 |
| 8/6/14 | 88.04 |
| 8/7/14 | 86.2 |
| 8/8/14 | 86.39 |
| 8/11/14 | 88.83 |
| 8/12/14 | 87.2 |
| 8/13/14 | 87.83 |
| 8/14/14 | 88.28 |
| 8/15/14 | 86.24 |
| 8/18/14 | 88.03 |
| 8/19/14 | 89.02 |
| 8/20/14 | 88.61 |
| 8/21/14 | 89.78 |
| 8/22/14 | 89.06 |
| 8/25/14 | 91.13 |
| 8/26/14 | 91.14 |
| 8/27/14 | 90.28 |
| 8/28/14 | 89.28 |
| 8/29/14 | 88.6 |
| 9/1/14 | 88.01 |
| 9/2/14 | 87.99 |
| 9/3/14 | 90.01 |
| 9/4/14 | 91.54 |
| 9/5/14 | 92.05 |
| 9/8/14 | 91.91 |
| 9/9/14 | 91.24 |
| 9/10/14 | 90.33 |
| 9/11/14 | 90 |
| 9/12/14 | 89.43 |
| 9/15/14 | 89.49 |
| 9/16/14 | 89.27 |
| 9/17/14 | 89.8 |
| 9/18/14 | 90.38 |
| 9/19/14 | 88.99 |
| 9/22/14 | 86.77 |
| 9/23/14 | 84.9 |
| 9/24/14 | 86.79 |
| 9/25/14 | 85.25 |
| 9/26/14 | 85.64 |
| 9/29/14 | 85.21 |
| 9/30/14 | 85.02 |
| 10/1/14 | 84.83 |
| 10/2/14 | 83.62 |
| 10/6/14 | 81.98 |
| 10/7/14 | 82.33 |
| 10/8/14 | 81.24 |
| 10/9/14 | 82.5 |
| 10/10/14 | 79.53 |
| 10/13/14 | 79.44 |
| 10/14/14 | 79.47 |
| 10/15/14 | 77.41 |
| 10/16/14 | 77.85 |
| 10/17/14 | 80.57 |
| 10/20/14 | 79.61 |
| 10/21/14 | 81.35 |
| 10/22/14 | 82.59 |
| 10/23/14 | 83.15 |
| 10/24/14 | 82.29 |
| 10/27/14 | 81.29 |
| 10/28/14 | 82.42 |
| 10/29/14 | 82.67 |
| 10/30/14 | 83.03 |
| 10/31/14 | 85.32 |
| 11/3/14 | 85.27 |
| 11/4/14 | 82.89 |
| 11/5/14 | 83.85 |
| 11/6/14 | 84.38 |
| 11/7/14 | 83.33 |
| 11/10/14 | 83.91 |
| 11/11/14 | 84.31 |
| 11/12/14 | 82.71 |
| 11/13/14 | 82.72 |
| 11/14/14 | 83.06 |
| 11/17/14 | 83.46 |
| 11/18/14 | 84.43 |
| 11/19/14 | 84.75 |
| 11/20/14 | 84.9 |
| 11/21/14 | 88.16 |
| 11/24/14 | 89.4 |
| 11/25/14 | 90.35 |
| 11/26/14 | 90.48 |
| 11/27/14 | 91.49 |
| 11/28/14 | 91.95 |
| 12/1/14 | 92.23 |
| 12/2/14 | 91.81 |
| 12/3/14 | 91.25 |
| 12/4/14 | 89.87 |
| 12/5/14 | 92.35 |
| 12/8/14 | 91.6 |
| 12/9/14 | 88.9 |
| 12/10/14 | 89.79 |
| 12/11/14 | 90.31 |
| 12/12/14 | 87.98 |
| 12/15/14 | 85.01 |
| 12/16/14 | 88.06 |
| 12/17/14 | 87.5 |
| 12/18/14 | 90.33 |
| 12/19/14 | 89.94 |
| 12/22/14 | 90.02 |
| 12/23/14 | 90.83 |
| 12/29/14 | 91.01 |
| 12/30/14 | 89.77 |
| 12/31/14 | 89.77 |
| 1/2/15 | 88.01 |
| 1/5/15 | 85.08 |
| 1/6/15 | 85.83 |
| 1/7/15 | 86.29 |
| 1/8/15 | 89.39 |
| 1/9/15 | 88.16 |
| 1/12/15 | 88.65 |
| 1/13/15 | 90.63 |
| 1/14/15 | 88.78 |
| 1/15/15 | 91.07 |
| 1/16/15 | 93.59 |
| 1/19/15 | 94.22 |
| 1/20/15 | 94.74 |
| 1/21/15 | 94.92 |
| 1/22/15 | 98.04 |
| 1/23/15 | 102.8 |
| 1/26/15 | 105.25 |
| 1/27/15 | 102 |
| 1/28/15 | 103.1 |
| 1/29/15 | 102.95 |
| 1/30/15 | 103.4 |
| 2/2/15 | 104.25 |
| 2/3/15 | 106.3 |
| 2/4/15 | 106.65 |
| 2/5/15 | 106.65 |
| 2/6/15 | 106.85 |
| 2/9/15 | 102.5 |
| 2/10/15 | 104.7 |
| 2/11/15 | 104.45 |
| 2/12/15 | 106.7 |
| 2/13/15 | 107.8 |
| 2/16/15 | 106.6 |
| 2/17/15 | 106.75 |
| 2/18/15 | 108.75 |
| 2/19/15 | 109.45 |
| 2/20/15 | 111.1 |
| 2/23/15 | 111.65 |
| 2/24/15 | 110.65 |
| 2/25/15 | 109.65 |
| 2/26/15 | 112 |
| 2/27/15 | 113 |
| 3/2/15 | 114.2 |
| 3/3/15 | 111 |
| 3/4/15 | 113 |
| 3/5/15 | 114.5 |
| 3/6/15 | 115.3 |
| 3/9/15 | 114.35 |
| 3/10/15 | 113.7 |
| 3/11/15 | 119.35 |
| 3/12/15 | 118.55 |
| 3/13/15 | 119.95 |
| 3/16/15 | 122.6 |
| 3/17/15 | 121 |
| 3/18/15 | 115.9 |
| 3/19/15 | 116.6 |
| 3/20/15 | 116.75 |
| 3/23/15 | 113.75 |
| 3/24/15 | 115.1 |
| 3/25/15 | 114.15 |
| 3/26/15 | 116.45 |
| 3/27/15 | 116.1 |
| 3/30/15 | 118 |
| 3/31/15 | 116.45 |
| 4/1/15 | 115.5 |
| 4/2/15 | 114.95 |
| 4/7/15 | 114.9 |
| 4/8/15 | 113.25 |
| 4/9/15 | 116.2 |
| 4/10/15 | 117.35 |
| 4/13/15 | 116.25 |
| 4/14/15 | 115.15 |
| 4/15/15 | 115.4 |
| 4/16/15 | 112.9 |
| 4/17/15 | 110.4 |
| 4/20/15 | 111.7 |
| 4/21/15 | 112 |
| 4/22/15 | 110 |
| 4/23/15 | 110.25 |
| 4/24/15 | 110.45 |
| 4/27/15 | 113 |
| 4/28/15 | 109.85 |
| 4/29/15 | 106.35 |
| 4/30/15 | 106.1 |
| 5/4/15 | 106.75 |
| 5/5/15 | 106.5 |
| 5/6/15 | 104.1 |
| 5/7/15 | 104.6 |
| 5/8/15 | 109.5 |
| 5/11/15 | 109.3 |
| 5/12/15 | 106.35 |
| 5/13/15 | 104.9 |
| 5/14/15 | 104.6 |
| 5/15/15 | 102 |
| 5/18/15 | 103.35 |
| 5/19/15 | 107.15 |
| 5/20/15 | 106.45 |
| 5/21/15 | 105.35 |
| 5/22/15 | 104.8 |
| 5/26/15 | 103.6 |
| 5/27/15 | 104.9 |
| 5/28/15 | 103.05 |
| 5/29/15 | 100.7 |
| 6/1/15 | 100.75 |
| 6/2/15 | 100.2 |
| 6/3/15 | 101.25 |
| 6/4/15 | 100.3 |
| 6/5/15 | 99.59 |
| 6/8/15 | 97.37 |
| 6/9/15 | 98.04 |
| 6/10/15 | 100.8 |
| 6/11/15 | 101.25 |
| 6/12/15 | 99.92 |
| 6/15/15 | 98.59 |
| 6/16/15 | 98.35 |
| 6/17/15 | 97.01 |
| 6/18/15 | 97.88 |
| 6/19/15 | 97.74 |
| 6/22/15 | 102.3 |
| 6/23/15 | 104.35 |
| 6/24/15 | 103.25 |
| 6/25/15 | 103.7 |
| 6/26/15 | 103.5 |
| 6/29/15 | 99.3 |
| 6/30/15 | 98.18 |
| 7/1/15 | 100.5 |
| 7/2/15 | 99.2 |
| 7/3/15 | 98.9 |
| 7/6/15 | 97.26 |
| 7/7/15 | 93.9 |
| 7/8/15 | 92.09 |
| 7/9/15 | 93.99 |
| 7/10/15 | 95.2 |
| 7/13/15 | 94.97 |
| 7/14/15 | 94.67 |
| 7/15/15 | 93.55 |
| 7/16/15 | 95.74 |
| 7/17/15 | 95.58 |
| 7/20/15 | 95.61 |
| 7/21/15 | 95.14 |
| 7/22/15 | 94.13 |
| 7/23/15 | 93.69 |
| 7/24/15 | 91.64 |
| 7/27/15 | 89.08 |
| 7/28/15 | 90.18 |
| 7/29/15 | 89.48 |
| 7/30/15 | 89.86 |
| 7/31/15 | 91.3 |
| 8/3/15 | 92.06 |
| 8/4/15 | 90.88 |
| 8/5/15 | 92.97 |
| 8/6/15 | 92.18 |
| 8/7/15 | 92.88 |
| 8/10/15 | 93.4 |
| 8/11/15 | 89.42 |
| 8/12/15 | 86.09 |
| 8/13/15 | 86.19 |
| 8/14/15 | 86.15 |
| 8/17/15 | 86.63 |
| 8/18/15 | 85.87 |
| 8/19/15 | 83.87 |
| 8/20/15 | 82 |
| 8/21/15 | 80.13 |
| 8/24/15 | 76.93 |
| 8/25/15 | 81.82 |
| 8/26/15 | 80.62 |
| 8/27/15 | 82.95 |
| 8/28/15 | 82.94 |
| 8/31/15 | 82.22 |
| 9/1/15 | 80.1 |
| 9/2/15 | 79.55 |
| 9/3/15 | 82.16 |
| 9/4/15 | 80.32 |
| 9/7/15 | 80.94 |
| 9/8/15 | 84.04 |
| 9/9/15 | 85.54 |
| 9/10/15 | 86.06 |
| 9/11/15 | 85.53 |
| 9/14/15 | 85.34 |
| 9/15/15 | 87.23 |
| 9/16/15 | 87.42 |
| 9/17/15 | 88.26 |
| 9/18/15 | 85.71 |
| 9/21/15 | 84.4 |
| 9/22/15 | 79.32 |
| 9/23/15 | 79.79 |
| 9/24/15 | 75.68 |
| 9/25/15 | 78.89 |
| 9/28/15 | 76.59 |
| 9/29/15 | 76.37 |
| 9/30/15 | 79.22 |
| 10/1/15 | 78.33 |
| 10/2/15 | 78.21 |
| 10/5/15 | 81.17 |
| 10/6/15 | 82.22 |
| 10/7/15 | 85.74 |
| 10/8/15 | 86.2 |
| 10/9/15 | 87.8 |
| 10/12/15 | 89.25 |
| 10/13/15 | 88.11 |
| 10/14/15 | 86.74 |
| 10/15/15 | 87.01 |
| 10/16/15 | 86.74 |
| 10/19/15 | 87.69 |
| 10/20/15 | 87.28 |
| 10/21/15 | 88 |
| 10/22/15 | 90.35 |
| 10/23/15 | 93.29 |
| 10/26/15 | 92.91 |
| 10/27/15 | 92.38 |
| 10/28/15 | 92.97 |
| 10/29/15 | 93.34 |
| 10/30/15 | 93.36 |
| 11/2/15 | 94.36 |
| 11/3/15 | 93.57 |
| 11/4/15 | 92.45 |
| 11/5/15 | 92.78 |
| 11/6/15 | 96.03 |
| 11/9/15 | 94.96 |
| 11/10/15 | 95.93 |
| 11/11/15 | 96.18 |
| 11/12/15 | 94.46 |
| 11/13/15 | 94.54 |
| 11/16/15 | 94.71 |
| 11/17/15 | 97.26 |
| 11/18/15 | 97.45 |
| 11/19/15 | 98.73 |
| 11/20/15 | 99.17 |
| 11/23/15 | 98.45 |
| 11/24/15 | 96.76 |
| 11/25/15 | 99.5 |
| 11/26/15 | 100.85 |
| 11/27/15 | 101.5 |
| 11/30/15 | 103.3 |
| 12/1/15 | 103.3 |
| 12/2/15 | 102.65 |
| 12/3/15 | 98.34 |
| 12/4/15 | 98.17 |
| 12/7/15 | 99.99 |
| 12/8/15 | 97.2 |
| 12/9/15 | 97.14 |
| 12/10/15 | 97.27 |
| 12/11/15 | 94.11 |
| 12/14/15 | 91.9 |
| 12/15/15 | 94.69 |
| 12/16/15 | 95.49 |
| 12/17/15 | 98.72 |
| 12/18/15 | 96.71 |
| 12/21/15 | 95.5 |
| 12/22/15 | 96.35 |
| 12/23/15 | 98.55 |
| 12/25/15 | 98.55 |
| 12/28/15 | 97.35 |
| 12/29/15 | 98.56 |
| 12/30/15 | 97.63 |
| 1/4/16 | 92.25 |
| 1/5/16 | 91.82 |
| 1/6/16 | 88.78 |
| 1/7/16 | 85.44 |
| 1/8/16 | 83.44 |
| 1/11/16 | 83.14 |
| 1/12/16 | 84.85 |
| 1/13/16 | 82.89 |
| 1/14/16 | 80.11 |
| 1/15/16 | 78.02 |
| 1/18/16 | 78.1 |
| 1/19/16 | 78.86 |
| 1/20/16 | 76.77 |
| 1/21/16 | 78.7 |
| 1/22/16 | 79.71 |
| 1/25/16 | 78.92 |
| 1/26/16 | 79.4 |
| 1/27/16 | 79.96 |
| 1/28/16 | 77.62 |
| 1/29/16 | 76.66 |
| 2/1/16 | 75.47 |
| 2/2/16 | 74.03 |
| 2/3/16 | 72.7 |
| 2/4/16 | 71.49 |
| 2/5/16 | 72.41 |
| 2/8/16 | 69.3 |
| 2/9/16 | 67.83 |
| 2/10/16 | 69.08 |
| 2/11/16 | 67.18 |
| 2/12/16 | 70.26 |
| 2/15/16 | 73.08 |
| 2/16/16 | 72.82 |
| 2/17/16 | 75.39 |
| 2/18/16 | 75.35 |
| 2/19/16 | 73.83 |
| 2/22/16 | 75.2 |
| 2/23/16 | 73.14 |
| 2/24/16 | 70.2 |
| 2/25/16 | 71.3 |
| 2/26/16 | 73.89 |
| 2/29/16 | 75.15 |
| 3/1/16 | 78.31 |
| 3/2/16 | 80.43 |
| 3/3/16 | 81.15 |
| 3/4/16 | 82.63 |
| 3/7/16 | 81.87 |
| 3/8/16 | 80.02 |
| 3/9/16 | 78.54 |
| 3/10/16 | 75.42 |
| 3/11/16 | 78.72 |
| 3/14/16 | 80.23 |
| 3/15/16 | 79.56 |
| 3/16/16 | 82.63 |
| 3/17/16 | 81.02 |
| 3/18/16 | 81.58 |
| 3/21/16 | 81.2 |
| 3/22/16 | 81.38 |
| 3/23/16 | 81.06 |
| 3/24/16 | 79.58 |
| 3/29/16 | 80.45 |
| 3/30/16 | 82.11 |
| 3/31/16 | 80.7 |
| 4/1/16 | 78 |
| 4/4/16 | 77.54 |
| 4/5/16 | 74.63 |
| 4/6/16 | 75 |
| 4/7/16 | 73.85 |
| 4/8/16 | 74.3 |
| 4/11/16 | 74.79 |
| 4/12/16 | 75.35 |
| 4/13/16 | 78 |
| 4/14/16 | 79.2 |
| 4/15/16 | 78.37 |
| 4/18/16 | 80.41 |
| 4/19/16 | 83.07 |
| 4/20/16 | 84.02 |
| 4/21/16 | 84.15 |
| 4/22/16 | 82.78 |
| 4/25/16 | 81.94 |
| 4/26/16 | 82.6 |
| 4/27/16 | 83.36 |
| 4/28/16 | 83.94 |
| 4/29/16 | 80.5 |
| 5/2/16 | 81.12 |
| 5/3/16 | 78.03 |
| 5/4/16 | 76.45 |
| 5/5/16 | 75.53 |
| 5/6/16 | 75.69 |
| 5/9/16 | 76.52 |
| 5/10/16 | 78.01 |
| 5/11/16 | 76.9 |
| 5/12/16 | 75.72 |
| 5/13/16 | 73.77 |
| 5/17/16 | 71.56 |
| 5/18/16 | 70.99 |
| 5/19/16 | 70.66 |
| 5/20/16 | 71.7 |
| 5/23/16 | 70.82 |
| 5/24/16 | 72.14 |
| 5/25/16 | 73.86 |
| 5/26/16 | 75.45 |
| 5/27/16 | 75.16 |
| 5/30/16 | 75.76 |
| 5/31/16 | 75.89 |
| 6/1/16 | 73.93 |
| 6/2/16 | 74.05 |
| 6/3/16 | 72.27 |
| 6/6/16 | 72.24 |
| 6/7/16 | 73.83 |
| 6/8/16 | 73 |
| 6/9/16 | 71.84 |
| 6/10/16 | 70.7 |
| 6/13/16 | 69.34 |
| 6/14/16 | 67.6 |
| 6/15/16 | 68.56 |
| 6/16/16 | 68.3 |
| 6/17/16 | 68.97 |
| 6/20/16 | 72.24 |
| 6/21/16 | 72.64 |
| 6/22/16 | 72.47 |
| 6/23/16 | 74.25 |
| 6/24/16 | 68.66 |
| 6/27/16 | 65.67 |
| 6/28/16 | 65.83 |
| 6/29/16 | 65.88 |
| 6/30/16 | 65.79 |
| 7/1/16 | 67.79 |
| 7/4/16 | 66.79 |
| 7/5/16 | 65.21 |
| 7/6/16 | 65.1 |
| 7/7/16 | 65.6 |
| 7/8/16 | 68.44 |
| 7/11/16 | 70.04 |
| 7/12/16 | 73.31 |
| 7/13/16 | 72.98 |
| 7/14/16 | 74.74 |
| 7/15/16 | 74.66 |
| 7/18/16 | 74.91 |
| 7/19/16 | 73.58 |
| 7/20/16 | 75.39 |
| 7/21/16 | 75.98 |
| 7/22/16 | 75.5 |
| 7/25/16 | 76.14 |
| 7/26/16 | 76.78 |
| 7/27/16 | 78.36 |
| 7/28/16 | 75.97 |
| 7/29/16 | 77.05 |
| 8/1/16 | 77.13 |
| 8/2/16 | 75.41 |
| 8/3/16 | 75.81 |
| 8/4/16 | 75.84 |
| 8/5/16 | 77.92 |
| 8/8/16 | 77.63 |
| 8/9/16 | 80.29 |
| 8/10/16 | 80.19 |
| 8/11/16 | 80.37 |
| 8/12/16 | 79.63 |
| 8/15/16 | 80.5 |
| 8/16/16 | 79.49 |
| 8/17/16 | 78.55 |
| 8/18/16 | 78.84 |
| 8/19/16 | 77.32 |
| 8/22/16 | 76.95 |
| 8/23/16 | 77.48 |
| 8/24/16 | 77.51 |
| 8/25/16 | 76.22 |
| 8/26/16 | 77.23 |
| 8/29/16 | 76.88 |
| 8/30/16 | 78.46 |
| 8/31/16 | 78.01 |
| 9/1/16 | 77.93 |
| 9/2/16 | 78.57 |
| 9/5/16 | 78.24 |
| 9/6/16 | 77.55 |
| 9/7/16 | 78.24 |
| 9/8/16 | 77.44 |
| 9/9/16 | 76.93 |
| 9/12/16 | 75.58 |
| 9/13/16 | 75.41 |
| 9/14/16 | 75.1 |
| 9/15/16 | 75.3 |
| 9/16/16 | 73.42 |
| 9/19/16 | 73.97 |
| 9/20/16 | 74.09 |
| 9/21/16 | 74.36 |
| 9/22/16 | 76.28 |
| 9/23/16 | 75.59 |
| 9/26/16 | 73.73 |
| 9/27/16 | 73.18 |
| 9/28/16 | 73.68 |
| 9/29/16 | 73.7 |
| 9/30/16 | 74.81 |
| 10/4/16 | 77.29 |
| 10/5/16 | 78.18 |
| 10/6/16 | 78.3 |
| 10/7/16 | 77.41 |
| 10/10/16 | 78.09 |
| 10/11/16 | 77.66 |
| 10/12/16 | 77 |
| 10/13/16 | 75.94 |
| 10/14/16 | 76.84 |
| 10/17/16 | 76.34 |
| 10/18/16 | 77.01 |
| 10/19/16 | 78.02 |
| 10/20/16 | 79.17 |
| 10/21/16 | 78.63 |
| 10/24/16 | 79.59 |
| 10/25/16 | 79.63 |
| 10/26/16 | 80.07 |
| 10/27/16 | 79.92 |
| 10/28/16 | 80.17 |
| 10/31/16 | 79.37 |
| 11/1/16 | 78.32 |
| 11/2/16 | 75.4 |
| 11/3/16 | 75.23 |
| 11/4/16 | 75.46 |
| 11/7/16 | 77.2 |
| 11/8/16 | 77.31 |
| 11/9/16 | 76.84 |
| 11/10/16 | 76.78 |
| 11/11/16 | 80.11 |
| 11/14/16 | 80.88 |
| 11/15/16 | 81.53 |
| 11/16/16 | 80.74 |
| 11/17/16 | 80.42 |
| 11/18/16 | 81 |
| 11/21/16 | 82.37 |
| 11/22/16 | 83.3 |
| 11/23/16 | 82.24 |
| 11/24/16 | 82.51 |
| 11/25/16 | 82.79 |
| 11/28/16 | 82.06 |
| 11/29/16 | 81.2 |
| 11/30/16 | 80.41 |
| 12/1/16 | 80.07 |
| 12/2/16 | 79.82 |
| 12/5/16 | 82.4 |
| 12/6/16 | 83.37 |
| 12/7/16 | 86.32 |
| 12/8/16 | 88.99 |
| 12/9/16 | 88.77 |
| 12/12/16 | 88.09 |
| 12/13/16 | 88.9 |
| 12/14/16 | 89.05 |
| 12/15/16 | 89.75 |
| 12/16/16 | 90 |
| 12/19/16 | 90.11 |
| 12/20/16 | 90.25 |
| 12/21/16 | 90.07 |
| 12/22/16 | 89.67 |
| 12/23/16 | 89.96 |
| 12/27/16 | 89.7 |
| 12/28/16 | 89.85 |
| 12/29/16 | 88.52 |
| 12/30/16 | 88.75 |
| 1/2/17 | 89.98 |
| 1/3/17 | 90.83 |
| 1/4/17 | 90.18 |
| 1/5/17 | 90.34 |
| 1/6/17 | 90.51 |
| 1/9/17 | 89.83 |
| 1/10/17 | 89.91 |
| 1/11/17 | 90.13 |
| 1/12/17 | 87.46 |
| 1/13/17 | 87.81 |
| 1/16/17 | 86.53 |
| 1/17/17 | 86.47 |
| 1/18/17 | 87 |
| 1/19/17 | 86.59 |
| 1/20/17 | 87.15 |
| 1/23/17 | 86.26 |
| 1/24/17 | 87.33 |
| 1/25/17 | 88.8 |
| 1/26/17 | 88.13 |
| 1/27/17 | 87.41 |
| 1/30/17 | 86.29 |
| 1/31/17 | 84.17 |
| 2/1/17 | 84.62 |
| 2/2/17 | 84.2 |
| 2/3/17 | 84.03 |
| 2/6/17 | 82.94 |
| 2/7/17 | 82.78 |
| 2/8/17 | 83.49 |
| 2/9/17 | 84.79 |
| 2/10/17 | 85.07 |
| 2/13/17 | 86.69 |
| 2/14/17 | 86.3 |
| 2/15/17 | 86.18 |
| 2/16/17 | 85.45 |
| 2/17/17 | 85.03 |
| 2/20/17 | 85.07 |
| 2/21/17 | 86.53 |
| 2/22/17 | 86.81 |
| 2/23/17 | 85.76 |
| 2/24/17 | 84.25 |
| 2/27/17 | 84.52 |
| 2/28/17 | 84.37 |
| 3/1/17 | 86.67 |
| 3/2/17 | 87.18 |
| 3/3/17 | 87 |
| 3/6/17 | 86.35 |
| 3/7/17 | 86.32 |
| 3/8/17 | 86.65 |
| 3/9/17 | 84.43 |
| 3/10/17 | 83.54 |
| 3/13/17 | 83.89 |
| 3/14/17 | 83.4 |
| 3/15/17 | 83.19 |
| 3/16/17 | 83.68 |
| 3/17/17 | 82.89 |
| 3/20/17 | 82.5 |
| 3/21/17 | 82.93 |
| 3/22/17 | 82.74 |
| 3/23/17 | 83.08 |
| 3/24/17 | 83.68 |
| 3/27/17 | 83.48 |
| 3/28/17 | 84.48 |
| 3/29/17 | 84.81 |
| 3/30/17 | 85.58 |
| 3/31/17 | 85.51 |
| 4/3/17 | 84.87 |
| 4/4/17 | 83.95 |
| 4/5/17 | 83.24 |
| 4/6/17 | 82.95 |
| 4/7/17 | 82.79 |
| 4/10/17 | 82.71 |
| 4/11/17 | 82.63 |
| 4/12/17 | 83.39 |
| 4/13/17 | 82.83 |
| 4/18/17 | 82.44 |
| 4/19/17 | 83.98 |
| 4/20/17 | 84.08 |
| 4/21/17 | 84.93 |
| 4/24/17 | 87.43 |
| 4/25/17 | 87.77 |
| 4/26/17 | 88.66 |
| 4/27/17 | 87.7 |
| 4/28/17 | 87.65 |
| 5/2/17 | 87.71 |
| 5/3/17 | 86.9 |
| 5/4/17 | 87.3 |
| 5/5/17 | 89.1 |
| 5/8/17 | 89.89 |
| 5/9/17 | 89.53 |
| 5/10/17 | 90.52 |
| 5/11/17 | 90.14 |
| 5/12/17 | 87.24 |
| 5/15/17 | 87.35 |
| 5/16/17 | 86.69 |
| 5/17/17 | 86.43 |
| 5/18/17 | 85.19 |
| 5/19/17 | 86.18 |
| 5/22/17 | 85.9 |
| 5/23/17 | 86.27 |
| 5/24/17 | 85.77 |
| 5/25/17 | 85.24 |
| 5/26/17 | 84.31 |
| 5/29/17 | 84.56 |
| 5/30/17 | 84.24 |
| 5/31/17 | 83.29 |
| 6/1/17 | 84.92 |
| 6/2/17 | 85.93 |
| 6/5/17 | 85.93 |
| 6/6/17 | 84.83 |
| 6/7/17 | 84.6 |
| 6/8/17 | 84.11 |
| 6/9/17 | 84.43 |
| 6/12/17 | 84.9 |
| 6/13/17 | 85.06 |
| 6/14/17 | 84.11 |
| 6/15/17 | 83.42 |
| 6/16/17 | 83.36 |
| 6/19/17 | 84 |
| 6/20/17 | 83.65 |
| 6/21/17 | 83.6 |
| 6/22/17 | 84.17 |
| 6/23/17 | 83.6 |
| 6/26/17 | 83.49 |
| 6/27/17 | 82.86 |
| 6/28/17 | 83.68 |
| 6/29/17 | 82.72 |
| 6/30/17 | 81.28 |
| 7/3/17 | 82.98 |
| 7/4/17 | 82.28 |
| 7/5/17 | 81.53 |
| 7/6/17 | 81.44 |
| 7/7/17 | 81.38 |
| 7/10/17 | 81.62 |
| 7/11/17 | 83.01 |
| 7/12/17 | 84.2 |
| 7/13/17 | 84.36 |
| 7/14/17 | 83.74 |
| 7/17/17 | 83.65 |
| 7/18/17 | 83.28 |
| 7/19/17 | 83.28 |
| 7/20/17 | 83.37 |
| 7/21/17 | 81.19 |
| 7/24/17 | 78.94 |
| 7/25/17 | 79.43 |
| 7/26/17 | 79.11 |
| 7/27/17 | 78.5 |
| 7/28/17 | 77.85 |
| 7/31/17 | 77.71 |
| 8/1/17 | 78.89 |
| 8/2/17 | 78.86 |
| 8/3/17 | 79.38 |
| 8/4/17 | 81.35 |
| 8/7/17 | 81 |
| 8/8/17 | 80.79 |
| 8/9/17 | 80.07 |
| 8/10/17 | 80.05 |
| 8/11/17 | 79.95 |
| 8/14/17 | 80.2 |
| 8/15/17 | 80 |
| 8/16/17 | 80.14 |
| 8/17/17 | 79.81 |
| 8/18/17 | 79.54 |
| 8/21/17 | 78.97 |
| 8/22/17 | 79.38 |
| 8/23/17 | 79.11 |
| 8/24/17 | 79.79 |
| 8/25/17 | 79.29 |
| 8/28/17 | 79.21 |
| 8/29/17 | 78.32 |
| 8/30/17 | 78.37 |
| 8/31/17 | 78 |
| 9/1/17 | 79 |
| 9/4/17 | 79.13 |
| 9/5/17 | 80.5 |
| 9/6/17 | 81.76 |
| 9/7/17 | 82.65 |
| 9/8/17 | 82.52 |
| 9/11/17 | 82.85 |
| 9/12/17 | 83.6 |
| 9/13/17 | 84.07 |
| 9/14/17 | 84.37 |
| 9/15/17 | 84.83 |
| 9/18/17 | 84.62 |
| 9/19/17 | 84.71 |
| 9/20/17 | 84.46 |
| 9/21/17 | 85.14 |
| 9/22/17 | 85.09 |
| 9/25/17 | 84.78 |
| 9/26/17 | 84.89 |
| 9/27/17 | 84.97 |
| 9/28/17 | 84.42 |
| 9/29/17 | 85.83 |
| 10/2/17 | 86.16 |
| 10/3/17 | 86.16 |
| 10/4/17 | 88.48 |
| 10/5/17 | 88.71 |
| 10/6/17 | 89.05 |
| 10/9/17 | 88.87 |
| 10/10/17 | 88.42 |
| 10/11/17 | 88.39 |
| 10/12/17 | 87.82 |
| 10/13/17 | 87.27 |
| 10/16/17 | 87.08 |
| 10/17/17 | 87.44 |
| 10/18/17 | 88.2 |
| 10/19/17 | 87.41 |
| 10/20/17 | 86.3 |
| 10/23/17 | 86.01 |
| 10/24/17 | 86.42 |
| 10/25/17 | 85.46 |
| 10/26/17 | 86.28 |
| 10/27/17 | 87.22 |
| 10/30/17 | 87.5 |
| 10/31/17 | 87.5 |
| 11/1/17 | 89.34 |
| 11/2/17 | 89.87 |
| 11/3/17 | 89.57 |
| 11/6/17 | 89.97 |
| 11/7/17 | 87.42 |
| 11/8/17 | 87.24 |
| 11/9/17 | 86.93 |
| 11/10/17 | 86.34 |
| 11/13/17 | 86.2 |
| 11/14/17 | 86.12 |
| 11/15/17 | 85.3 |
| 11/16/17 | 85.33 |
| 11/17/17 | 84.93 |
| 11/20/17 | 85.18 |
| 11/21/17 | 86.78 |
| 11/22/17 | 86.58 |
| 11/23/17 | 86.34 |
| 11/24/17 | 86.38 |
| 11/27/17 | 85.69 |
| 11/28/17 | 84.95 |
| 11/29/17 | 84.73 |
| 11/30/17 | 84.68 |
| 12/1/17 | 83.57 |
| 12/4/17 | 85.33 |
| 12/5/17 | 85.46 |
| 12/6/17 | 85.06 |
| 12/7/17 | 84.85 |
| 12/8/17 | 85.48 |
| 12/11/17 | 85.49 |
| 12/12/17 | 86 |
| 12/13/17 | 85.71 |
| 12/14/17 | 86.18 |
| 12/15/17 | 85.95 |
| 12/18/17 | 86.96 |
| 12/19/17 | 87.1 |
| 12/20/17 | 86.93 |
| 12/21/17 | 87.84 |
| 12/22/17 | 87.52 |
| 12/27/17 | 87.26 |
| 12/28/17 | 87.14 |
| 12/29/17 | 86.83 |
| 1/2/18 | 86.4 |
| 1/3/18 | 86.86 |
| 1/4/18 | 87.48 |
| 1/5/18 | 88.5 |
| 1/8/18 | 89.67 |
| 1/9/18 | 90.2 |
| 1/10/18 | 89.4 |
| 1/11/18 | 88.69 |
| 1/12/18 | 89.81 |
| 1/15/18 | 89.79 |
| 1/16/18 | 92.64 |
| 1/17/18 | 92.35 |
| 1/18/18 | 93.07 |
| 1/19/18 | 94.68 |
| 1/22/18 | 96.26 |
| 1/23/18 | 95.28 |
| 1/24/18 | 94.35 |
| 1/25/18 | 93.25 |
| 1/26/18 | 93.83 |
| 1/29/18 | 93.54 |
| 1/30/18 | 92.64 |
| 1/31/18 | 91.97 |
| 2/1/18 | 91.5 |
| 2/2/18 | 90.18 |
| 2/5/18 | 89.34 |
| 2/6/18 | 88.13 |
| 2/7/18 | 89.1 |
| 2/8/18 | 87.53 |
| 2/9/18 | 86.64 |
| 2/12/18 | 87.31 |
| 2/13/18 | 86.72 |
| 2/14/18 | 88 |
| 2/15/18 | 87.43 |
| 2/16/18 | 88.12 |
| 2/19/18 | 87.28 |
| 2/20/18 | 86.8 |
| 2/21/18 | 86.77 |
| 2/22/18 | 87.22 |
| 2/23/18 | 87.05 |
| 2/26/18 | 87.75 |
| 2/27/18 | 87.7 |
| 2/28/18 | 86.82 |
| 3/1/18 | 85.3 |
| 3/2/18 | 83.97 |
| 3/5/18 | 83.49 |
| 3/6/18 | 84.16 |
| 3/7/18 | 84.86 |
| 3/8/18 | 84.97 |
| 3/9/18 | 85.13 |
| 3/12/18 | 85.71 |
| 3/13/18 | 84.63 |
| 3/14/18 | 84.17 |
| 3/15/18 | 85.12 |
| 3/16/18 | 85.86 |
| 3/19/18 | 85.17 |
| 3/20/18 | 85.99 |
| 3/21/18 | 86.1 |
| 3/22/18 | 85.33 |
| 3/23/18 | 84.18 |
| 3/26/18 | 85.21 |
| 3/27/18 | 85.81 |
| 3/28/18 | 85.56 |
| 3/29/18 | 88.15 |
| 4/3/18 | 88.68 |
| 4/4/18 | 87.41 |
| 4/5/18 | 88.7 |
| 4/6/18 | 88.97 |
| 4/9/18 | 88.34 |
| 4/10/18 | 89.99 |
| 4/11/18 | 89.87 |
| 4/12/18 | 89.93 |
| 4/13/18 | 91.33 |
| 4/16/18 | 90.66 |
| 4/17/18 | 91.22 |
| 4/18/18 | 90.8 |
| 4/19/18 | 90.88 |
| 4/20/18 | 91.02 |
| 4/23/18 | 91.2 |
| 4/24/18 | 91.13 |
| 4/25/18 | 89.27 |
| 4/26/18 | 90.39 |
| 4/27/18 | 91.5 |
| 4/30/18 | 92.47 |
| 5/2/18 | 93.09 |
| 5/3/18 | 92.16 |
| 5/4/18 | 91.56 |
| 5/7/18 | 91.56 |
| 5/8/18 | 91.94 |
| 5/9/18 | 91.96 |
| 5/10/18 | 92.36 |
| 5/11/18 | 92.18 |
| 5/14/18 | 91.83 |
| 5/15/18 | 92.17 |
| 5/16/18 | 92.16 |
| 5/17/18 | 93.3 |
| 5/18/18 | 88.57 |
| 5/21/18 | 88.57 |
| 5/22/18 | 90.83 |
| 5/23/18 | 89 |
| 5/24/18 | 87.5 |
| 5/25/18 | 87.45 |
| 5/28/18 | 87.22 |
| 5/29/18 | 86.08 |
| 5/30/18 | 86.2 |
| 5/31/18 | 85.38 |
| 6/1/18 | 85.88 |
| 6/4/18 | 86.2 |
| 6/5/18 | 86.59 |
| 6/6/18 | 87 |
| 6/7/18 | 86.63 |
| 6/8/18 | 85.64 |
| 6/11/18 | 85.38 |
| 6/12/18 | 85.3 |
| 6/13/18 | 84.68 |
| 6/14/18 | 86.27 |
| 6/15/18 | 85.74 |
| 6/18/18 | 84.75 |
| 6/19/18 | 84.06 |
| 6/20/18 | 83.68 |
| 6/21/18 | 81.22 |
| 6/22/18 | 80.31 |
| 6/25/18 | 78.85 |
| 6/26/18 | 78.45 |
| 6/27/18 | 78.61 |
| 6/28/18 | 77.56 |
| 6/29/18 | 77.63 |
| 7/2/18 | 77.73 |
| 7/3/18 | 77.7 |
| 7/4/18 | 77.77 |
| 7/5/18 | 80.66 |
| 7/6/18 | 80.2 |
| 7/9/18 | 80.21 |
| 7/10/18 | 80.01 |
| 7/11/18 | 78.87 |
| 7/12/18 | 79.37 |
| 7/13/18 | 79.62 |
| 7/16/18 | 79.29 |
| 7/17/18 | 80.01 |
| 7/18/18 | 80.8 |
| 7/19/18 | 80.75 |
| 7/20/18 | 79.28 |
| 7/23/18 | 79.93 |
| 7/24/18 | 81.53 |
| 7/25/18 | 79.86 |
| 7/26/18 | 83.39 |
| 7/27/18 | 82.91 |
| 7/30/18 | 82.97 |
| 7/31/18 | 82.69 |
| 8/1/18 | 81.5 |
| 8/2/18 | 81.18 |
| 8/3/18 | 82.34 |
| 8/6/18 | 83.51 |
| 8/7/18 | 84.05 |
| 8/8/18 | 84.48 |
| 8/9/18 | 84.81 |
| 8/10/18 | 83.58 |
| 8/13/18 | 83.29 |
| 8/14/18 | 82.45 |
| 8/15/18 | 81.31 |
| 8/16/18 | 81.8 |
| 8/17/18 | 81.41 |
| 8/20/18 | 81.75 |
| 8/21/18 | 82.93 |
| 8/22/18 | 82.29 |
| 8/23/18 | 81.08 |
| 8/24/18 | 81.29 |
| 8/27/18 | 83.19 |
| 8/28/18 | 84.39 |
| 8/29/18 | 84.23 |
| 8/30/18 | 84.6 |
| 8/31/18 | 83.41 |
| 9/3/18 | 82.79 |
| 9/4/18 | 81.88 |
| 9/5/18 | 81.25 |
| 9/6/18 | 80.73 |
| 9/7/18 | 81.07 |
| 9/10/18 | 81.1 |
| 9/11/18 | 80.76 |
| 9/12/18 | 81.32 |
| 9/13/18 | 82.47 |
| 9/14/18 | 82.93 |
| 9/17/18 | 82.54 |
| 9/18/18 | 82.67 |
| 9/19/18 | 83.54 |
| 9/20/18 | 85.32 |
| 9/21/18 | 85.77 |
| 9/24/18 | 83.5 |
| 9/25/18 | 79 |
| 9/26/18 | 79.03 |
| 9/27/18 | 79 |
| 9/28/18 | 77.71 |
| 10/1/18 | 78.14 |
| 10/2/18 | 78.7 |
| 10/4/18 | 78.26 |
| 10/5/18 | 77.68 |
| 10/8/18 | 76.87 |
| 10/9/18 | 76.39 |
| 10/10/18 | 75.35 |
| 10/11/18 | 74.3 |
| 10/12/18 | 74.49 |
| 10/15/18 | 75.21 |
| 10/16/18 | 75.75 |
| 10/17/18 | 75.24 |
| 10/18/18 | 75.13 |
| 10/19/18 | 74.64 |
| 10/22/18 | 74.44 |
| 10/23/18 | 73.5 |
| 10/24/18 | 72.69 |
| 10/25/18 | 74.5 |
| 10/26/18 | 75.02 |
| 10/29/18 | 76.4 |
| 10/30/18 | 76.34 |
| 10/31/18 | 76.23 |
| 11/1/18 | 76.79 |
| 11/2/18 | 77.74 |
| 11/5/18 | 77.23 |
| 11/6/18 | 76.92 |
| 11/7/18 | 74.26 |
| 11/8/18 | 73.86 |
| 11/9/18 | 73.36 |
| 11/12/18 | 72.53 |
| 11/13/18 | 73.9 |
| 11/14/18 | 74.66 |
| 11/15/18 | 74.2 |
| 11/16/18 | 73.74 |
| 11/19/18 | 74.18 |
| 11/20/18 | 73.69 |
| 11/21/18 | 74.32 |
| 11/22/18 | 73.62 |
| 11/23/18 | 73.49 |
| 11/26/18 | 74.87 |
| 11/27/18 | 73.87 |
| 11/28/18 | 73.74 |
| 11/29/18 | 72.85 |
| 11/30/18 | 72.21 |
| 12/3/18 | 75.66 |
| 12/4/18 | 74.43 |
| 12/5/18 | 74.16 |
| 12/6/18 | 72.07 |
| 12/7/18 | 71.71 |
| 12/10/18 | 70.1 |
| 12/11/18 | 71.38 |
| 12/12/18 | 72.77 |
| 12/13/18 | 74.18 |
| 12/14/18 | 74.27 |
| 12/17/18 | 74 |
| 12/18/18 | 73.47 |
| 12/19/18 | 73.45 |
| 12/20/18 | 71.84 |
| 12/21/18 | 71.93 |
| 12/27/18 | 69.86 |
| 12/28/18 | 70.7 |
| 12/29/18 | 70.7 |
| 12/31/18 | 70.7 |
| 1/2/19 | 69.74 |
| 1/3/19 | 69.05 |
| 1/4/19 | 71.71 |
| 1/7/19 | 72.12 |
| 1/8/19 | 72.21 |
| 1/9/19 | 72.95 |
| 1/10/19 | 72.53 |
| 1/11/19 | 71.83 |
| 1/14/19 | 71.59 |
| 1/15/19 | 71.62 |
| 1/16/19 | 71.53 |
| 1/17/19 | 71.26 |
| 1/18/19 | 73.34 |
| 1/21/19 | 73.03 |
| 1/22/19 | 72.73 |
| 1/23/19 | 72.23 |
| 1/24/19 | 73.12 |
| 1/25/19 | 74.35 |
| 1/28/19 | 73.98 |
| 1/29/19 | 73.85 |
| 1/30/19 | 73.33 |
| 1/31/19 | 73.46 |
| 2/1/19 | 74.14 |
| 2/4/19 | 73.24 |
| 2/5/19 | 73.61 |
| 2/6/19 | 73.65 |
| 2/7/19 | 71.22 |
| 2/8/19 | 69.53 |
| 2/11/19 | 69.41 |
| 2/12/19 | 69.91 |
| 2/13/19 | 70.39 |
| 2/14/19 | 69.35 |
| 2/15/19 | 70.77 |
| 2/18/19 | 70.59 |
| 2/19/19 | 71.04 |
| 2/20/19 | 72.51 |
| 2/21/19 | 73.12 |
| 2/22/19 | 73.13 |
| 2/25/19 | 73.7 |
| 2/26/19 | 74 |
| 2/27/19 | 74.24 |
| 2/28/19 | 74.31 |
| 3/1/19 | 74.75 |
| 3/4/19 | 74.67 |
| 3/5/19 | 75.06 |
| 3/6/19 | 74.53 |
| 3/7/19 | 73.09 |
| 3/8/19 | 72.16 |
| 3/11/19 | 73.18 |
| 3/12/19 | 73.1 |
| 3/13/19 | 73.63 |
| 3/14/19 | 73.78 |
| 3/15/19 | 74.09 |
| 3/18/19 | 74.17 |
| 3/19/19 | 75.72 |
| 3/20/19 | 71.98 |
| 3/21/19 | 71.15 |
| 3/22/19 | 69.6 |
| 3/25/19 | 68.92 |
| 3/26/19 | 67.91 |
| 3/27/19 | 68.23 |
| 3/28/19 | 67.89 |
| 3/29/19 | 68.75 |
| 4/1/19 | 69.7 |
| 4/2/19 | 71.25 |
| 4/3/19 | 72.58 |
| 4/4/19 | 73.34 |
| 4/5/19 | 73.79 |
| 4/8/19 | 73.57 |
| 4/9/19 | 73.2 |
| 4/10/19 | 73.19 |
| 4/11/19 | 73.51 |
| 4/12/19 | 75.29 |
| 4/15/19 | 75.65 |
| 4/16/19 | 76.4 |
| 4/17/19 | 77.25 |
| 4/18/19 | 77.75 |
| 4/23/19 | 77.5 |
| 4/24/19 | 76.47 |
| 4/25/19 | 75.78 |
| 4/26/19 | 76.2 |
| 4/29/19 | 75.89 |
| 4/30/19 | 75.9 |
| 5/2/19 | 75.8 |
| 5/3/19 | 75.67 |
| 5/6/19 | 74 |
| 5/7/19 | 72.28 |
| 5/8/19 | 71.38 |
| 5/9/19 | 69.3 |
| 5/10/19 | 68.87 |
| 5/13/19 | 68.06 |
| 5/14/19 | 67.88 |
| 5/15/19 | 70 |
| 5/16/19 | 69.8 |
| 5/17/19 | 66.16 |
| 5/20/19 | 64.81 |
| 5/21/19 | 64.63 |
| 5/22/19 | 64.23 |
| 5/23/19 | 63.39 |
| 5/24/19 | 63.47 |
| 5/27/19 | 63.76 |
| 5/28/19 | 63.84 |
| 5/29/19 | 63.15 |
| 5/30/19 | 63.05 |
| 5/31/19 | 62.02 |
| 6/3/19 | 61.64 |
| 6/4/19 | 63.43 |
| 6/5/19 | 63.02 |
| 6/6/19 | 62.34 |
| 6/7/19 | 62.32 |
| 6/11/19 | 62.98 |
| 6/12/19 | 62.64 |
| 6/13/19 | 62.78 |
| 6/14/19 | 62.46 |
| 6/17/19 | 62.1 |
| 6/18/19 | 63.61 |
| 6/19/19 | 64.2 |
| 6/20/19 | 64.56 |
| 6/21/19 | 64.44 |
| 6/24/19 | 63.64 |
| 6/25/19 | 63.15 |
| 6/26/19 | 64.57 |
| 6/27/19 | 64.85 |
| 6/28/19 | 65.09 |
| 7/1/19 | 65.1 |
| 7/2/19 | 65.33 |
| 7/3/19 | 66.61 |
| 7/4/19 | 67.11 |
| 7/5/19 | 67.05 |
| 7/8/19 | 66.7 |
| 7/9/19 | 66.17 |
| 7/10/19 | 65.65 |
| 7/11/19 | 65.24 |
| 7/12/19 | 65.89 |
| 7/15/19 | 66.66 |
| 7/16/19 | 67.12 |
| 7/17/19 | 66.35 |
| 7/18/19 | 66.15 |
| 7/19/19 | 66.57 |
| 7/22/19 | 66.77 |
| 7/23/19 | 69.34 |
| 7/24/19 | 70.01 |
| 7/25/19 | 68.95 |
| 7/26/19 | 68.67 |
| 7/29/19 | 68.29 |
| 7/30/19 | 67.11 |
| 7/31/19 | 66.83 |
| 8/1/19 | 67.49 |
| 8/2/19 | 64.65 |
| 8/5/19 | 63.34 |
| 8/6/19 | 62.26 |
| 8/7/19 | 62.11 |
| 8/8/19 | 62.53 |
| 8/9/19 | 61.03 |
| 8/12/19 | 60.83 |
| 8/13/19 | 61.04 |
| 8/14/19 | 59.6 |
| 8/15/19 | 58.82 |
| 8/16/19 | 59.56 |
| 8/19/19 | 60.36 |
| 8/20/19 | 59.74 |
| 8/21/19 | 60.59 |
| 8/22/19 | 60.61 |
| 8/23/19 | 58.7 |
| 8/26/19 | 59.57 |
| 8/27/19 | 59.49 |
| 8/28/19 | 59.72 |
| 8/29/19 | 60.17 |
| 8/30/19 | 60.81 |
| 9/2/19 | 60.53 |
| 9/3/19 | 60.4 |
| 9/4/19 | 61.09 |
| 9/5/19 | 62.32 |
| 9/6/19 | 62.32 |
| 9/9/19 | 63.22 |
| 9/10/19 | 63.77 |
| 9/11/19 | 63.81 |
| 9/12/19 | 64.64 |
| 9/13/19 | 65.06 |
| 9/16/19 | 65.1 |
| 9/17/19 | 64.53 |
| 9/18/19 | 64.55 |
| 9/19/19 | 64.99 |
| 9/20/19 | 65.15 |
| 9/23/19 | 64 |
| 9/24/19 | 63.68 |
| 9/25/19 | 63.38 |
| 9/26/19 | 63.09 |
| 9/27/19 | 63.89 |
| 9/30/19 | 64.59 |
| 10/1/19 | 64.38 |
| 10/2/19 | 63.16 |
| 10/4/19 | 62.39 |
| 10/7/19 | 62.68 |
| 10/8/19 | 61.86 |
| 10/9/19 | 62.35 |
| 10/10/19 | 63.23 |
| 10/11/19 | 64.78 |
| 10/14/19 | 64.91 |
| 10/15/19 | 66.63 |
| 10/16/19 | 67.13 |
| 10/17/19 | 67.91 |
| 10/18/19 | 67.41 |
| 10/21/19 | 67.84 |
| 10/22/19 | 68.47 |
| 10/23/19 | 68.66 |
| 10/24/19 | 69.03 |
| 10/25/19 | 69.43 |
| 10/28/19 | 69.89 |
| 10/29/19 | 69.83 |
| 10/30/19 | 69.29 |
| 10/31/19 | 68.71 |
| 11/1/19 | 69.44 |
| 11/4/19 | 71.6 |
| 11/5/19 | 72.8 |
| 11/6/19 | 73.51 |
| 11/7/19 | 74.45 |
| 11/8/19 | 75.04 |
| 11/11/19 | 75.03 |
| 11/12/19 | 74.87 |
| 11/13/19 | 73.66 |
| 11/14/19 | 73.41 |
| 11/15/19 | 74.55 |
| 11/18/19 | 73.18 |
| 11/19/19 | 73.52 |
| 11/20/19 | 73.32 |
| 11/21/19 | 73.6 |
| 11/22/19 | 74.07 |
| 11/25/19 | 74.18 |
| 11/26/19 | 73.81 |
| 11/27/19 | 74.74 |
| 11/28/19 | 73.62 |
| 11/29/19 | 73.3 |
| 12/2/19 | 71.91 |
| 12/3/19 | 71.81 |
| 12/4/19 | 72.76 |
| 12/5/19 | 72.81 |
| 12/6/19 | 73.79 |
| 12/9/19 | 73.18 |
| 12/10/19 | 73.2 |
| 12/11/19 | 74.21 |
| 12/12/19 | 74.81 |
| 12/13/19 | 75.87 |
| 12/16/19 | 75.89 |
| 12/17/19 | 74.99 |
| 12/18/19 | 75.16 |
| 12/19/19 | 74.1 |
| 12/20/19 | 74.15 |
| 12/23/19 | 73.54 |
| 12/27/19 | 73.51 |
| 12/31/19 | 73.14 |
| 1/2/20 | 74.22 |
| 1/3/20 | 73.32 |
| 1/5/20 | 73.05 |
| 1/7/20 | 74.22 |
| 1/8/20 | 74.41 |
| 1/9/20 | 74.36 |
| 1/10/20 | 74.57 |
| 1/13/20 | 73.63 |
| 1/14/20 | 73.3 |
| 1/15/20 | 72.19 |
| 1/16/20 | 71.17 |
| 1/17/20 | 71.06 |
| 1/20/20 | 71.64 |
| 1/21/20 | 71.41 |
| 1/22/20 | 70.95 |
| 1/23/20 | 69.69 |
| 1/24/20 | 69.41 |
| 1/27/20 | 67.7 |
| 1/28/20 | 66.82 |
| 1/29/20 | 66.55 |
| 1/30/20 | 65.56 |
| 1/31/20 | 64.34 |
| 2/3/20 | 64.38 |
| 2/4/20 | 64.95 |
| 2/5/20 | 66.22 |
| 2/6/20 | 66.33 |
| 2/7/20 | 64.69 |
| 2/10/20 | 63.81 |
| 2/11/20 | 64.41 |
| 2/12/20 | 67.07 |
| 2/13/20 | 66.59 |
| 2/14/20 | 65.86 |
| 2/17/20 | 66.51 |
| 2/18/20 | 65.2 |
| 2/19/20 | 65.45 |
| 2/20/20 | 65.31 |
| 2/21/20 | 64.51 |
| 2/24/20 | 61.44 |
| 2/25/20 | 61.03 |
| 2/26/20 | 61.78 |
| 2/27/20 | 59.84 |
| 2/28/20 | 58.93 |
| 3/2/20 | 58 |
| 3/3/20 | 57.76 |
| 3/4/20 | 58.57 |
| 3/5/20 | 58.07 |
| 3/6/20 | 57.22 |
| 3/9/20 | 51.02 |
| 3/10/20 | 50.33 |
| 3/11/20 | 50.65 |
| 3/12/20 | 44.08 |
| 3/13/20 | 45.42 |
| 3/16/20 | 40.09 |
| 3/17/20 | 40.355 |
| 3/18/20 | 39.135 |
| 3/19/20 | 37.66 |
| 3/20/20 | 41.37 |
| 3/23/20 | 39.8 |
| 3/24/20 | 45.56 |
| 3/25/20 | 46.75 |
| 3/26/20 | 47.3 |
| 3/27/20 | 45.515 |
| 3/30/20 | 45.73 |
| 3/31/20 | 47.115 |
| 4/1/20 | 44.385 |
| 4/2/20 | 44.865 |
| 4/3/20 | 44.75 |
| 4/6/20 | 48.56 |
| 4/7/20 | 49.715 |
| 4/8/20 | 49.16 |
| 4/9/20 | 50.82 |
| 4/14/20 | 51.36 |
| 4/15/20 | 48.59 |
| 4/16/20 | 49.335 |
| 4/17/20 | 51.91 |
| 4/20/20 | 51.37 |
| 4/21/20 | 48.56 |
| 4/22/20 | 49.015 |
| 4/23/20 | 50.27 |
| 4/24/20 | 48.66 |
| 4/27/20 | 51.2 |
| 4/28/20 | 52.61 |
| 4/29/20 | 55.67 |
| 4/30/20 | 54.05 |
| 5/4/20 | 51.57 |
| 5/5/20 | 53.51 |
| 5/6/20 | 50.62 |
| 5/7/20 | 49.37 |
| 5/8/20 | 51.42 |
| 5/11/20 | 51.37 |
| 5/12/20 | 50.86 |
| 5/13/20 | 48.73 |
| 5/14/20 | 47.08 |
| 5/15/20 | 46.65 |
| 5/18/20 | 50.25 |
| 5/19/20 | 50.05 |
| 5/20/20 | 50.85 |
| 5/21/20 | 50.07 |
| 5/22/20 | 50.08 |
| 5/25/20 | 50.29 |
| 5/26/20 | 51.87 |
| 5/27/20 | 54.39 |
| 5/28/20 | 54 |
| 5/29/20 | 52.6 |
| 5/29/20 | 52.6 |
| 6/2/20 | 55.35 |
| 6/3/20 | 57.98 |
| 6/4/20 | 58.07 |
| 6/5/20 | 59.5 |
| 6/8/20 | 60.68 |
| 6/9/20 | 59.41 |
| 6/10/20 | 58.89 |
| 6/11/20 | 55.62 |
| 6/12/20 | 56.15 |
| 6/15/20 | 55.95 |
| 6/16/20 | 57.07 |
| 6/17/20 | 57.26 |
| 6/18/20 | 57.11 |
| 6/19/20 | 56.93 |
| 6/22/20 | 57.36 |
| 6/23/20 | 58.41 |
| 6/24/20 | 56.18 |
| 6/25/20 | 57.08 |
| 6/26/20 | 55.77 |
| 6/29/20 | 56.71 |
| 6/30/20 | 56.82 |
| 7/1/20 | 56.2 |
| 7/2/20 | 57.95 |
| 7/3/20 | 57.26 |
| 7/6/20 | 58.46 |
| 7/7/20 | 58.65 |
| 7/8/20 | 58.02 |
| 7/9/20 | 57.44 |
| 7/10/20 | 58.69 |
| 7/13/20 | 58.8 |
| 7/14/20 | 57.93 |
| 7/15/20 | 58.61 |
| 7/16/20 | 58.77 |
| 7/17/20 | 59.73 |
| 7/20/20 | 59.1 |
| 7/21/20 | 60.82 |
| 7/22/20 | 59.94 |
| 7/23/20 | 61.15 |
| 7/24/20 | 60.22 |
| 7/27/20 | 59.75 |
| 7/28/20 | 59.8 |
| 7/29/20 | 58.29 |
| 7/30/20 | 56.16 |
| 7/31/20 | 54.7 |
| 8/3/20 | 56.21 |
| 8/4/20 | 58.14 |
| 8/5/20 | 56.13 |
| 8/6/20 | 55.23 |
| 8/7/20 | 54.9 |
| 8/10/20 | 55.35 |
| 8/11/20 | 58.54 |
| 8/12/20 | 58.87 |
| 8/13/20 | 58.28 |
| 8/14/20 | 58.22 |
| 8/17/20 | 57.88 |
| 8/18/20 | 57.56 |
| 8/19/20 | 58.25 |
| 8/20/20 | 57.39 |
| 8/21/20 | 56.81 |
| 8/24/20 | 58.25 |
| 8/25/20 | 57.95 |
| 8/26/20 | 59.42 |
| 8/27/20 | 59.6 |
| 8/28/20 | 59.61 |
| 8/31/20 | 60.15 |
| 9/1/20 | 60.13 |
| 9/2/20 | 60.39 |
| 9/3/20 | 60.8 |
| 9/4/20 | 61.38 |
| 9/7/20 | 62.58 |
| 9/8/20 | 63.17 |
| 9/9/20 | 63.74 |
| 9/10/20 | 63.74 |
| 9/11/20 | 64.31 |
| 9/14/20 | 64.12 |
| 9/15/20 | 64.32 |
| 9/16/20 | 64.71 |
| 9/17/20 | 64.81 |
| 9/18/20 | 63.74 |
| 9/21/20 | 60.49 |
| 9/22/20 | 60.58 |
| 9/23/20 | 60.96 |
| 9/24/20 | 60.64 |
| 9/25/20 | 59.06 |
| 9/28/20 | 61.73 |
| 9/29/20 | 62 |
| 9/30/20 | 61.99 |
| 10/1/20 | 62.66 |
| 10/2/20 | 62.36 |
| 10/5/20 | 64.03 |
| 10/6/20 | 64.85 |
| 10/7/20 | 65.74 |
| 10/8/20 | 65.72 |
| 10/9/20 | 64.7 |
| 10/12/20 | 65.09 |
| 10/13/20 | 64.25 |
| 10/14/20 | 64.08 |
| 10/15/20 | 62.17 |
| 10/16/20 | 63.12 |
| 10/19/20 | 63.62 |
| 10/20/20 | 64.07 |
| 10/21/20 | 63.81 |
| 10/22/20 | 64.01 |
| 10/23/20 | 63.93 |
| 10/26/20 | 63.21 |
| 10/27/20 | 61.47 |
| 10/28/20 | 58.06 |
| 10/29/20 | 58.33 |
| 10/30/20 | 58.68 |
| 11/2/20 | 59.68 |
| 11/3/20 | 62.12 |
| 11/4/20 | 62.52 |
| 11/5/20 | 64.79 |
| 11/6/20 | 63.58 |
| 11/9/20 | 67.63 |
| 11/10/20 | 69.5 |
| 11/11/20 | 70.34 |
| 11/12/20 | 70.7 |
| 11/13/20 | 70.74 |
| 11/16/20 | 72.79 |
| 11/17/20 | 72.85 |
| 11/18/20 | 73.87 |
| 11/19/20 | 74 |
| 11/20/20 | 74.15 |
| 11/23/20 | 73.89 |
| 11/24/20 | 76.68 |
| 11/25/20 | 75.4 |
| 11/26/20 | 74.13 |
| 11/27/20 | 73.09 |
| 11/30/20 | 73.04 |
| 12/1/20 | 74.78 |
| 12/2/20 | 74.33 |
| 12/3/20 | 74.29 |
| 12/4/20 | 74.95 |
| 12/7/20 | 73.7 |
| 12/8/20 | 73.01 |
| 12/9/20 | 73.13 |
| 12/10/20 | 71.36 |
| 12/11/20 | 70.51 |
| 12/14/20 | 71.91 |
| 12/15/20 | 73.86 |
| 12/16/20 | 74.43 |
| 12/17/20 | 73.78 |
| 12/18/20 | 74.19 |
| 12/21/20 | 71.97 |
| 12/22/20 | 72.1 |
| 12/23/20 | 73.38 |
| 12/28/20 | 73.49 |
| 12/29/20 | 73.16 |
| 12/30/20 | 72.23 |
| 1/4/21 | 71.86 |
| 1/5/21 | 70.86 |
| 1/6/21 | 70.99 |
| 1/7/21 | 71.02 |
| 1/8/21 | 70.49 |
| 1/11/21 | 69.3 |
| 1/12/21 | 69.84 |
| 1/13/21 | 69.12 |
| 1/14/21 | 69.78 |
| 1/15/21 | 69.41 |
| 1/18/21 | 69.49 |
| 1/19/21 | 68.34 |
| 1/20/21 | 70.79 |
| 1/21/21 | 71.28 |
| 1/22/21 | 71.25 |
| 1/25/21 | 70.21 |
| 1/26/21 | 72.08 |
| 1/27/21 | 71.31 |
| 1/28/21 | 70.91 |
| 1/29/21 | 70.01 |
| 2/1/21 | 69.88 |
| 2/2/21 | 71.41 |
| 2/3/21 | 71.73 |
| 2/4/21 | 70.77 |
| 2/5/21 | 70.05 |
| 2/8/21 | 69.81 |
| 2/9/21 | 70.09 |
| 2/10/21 | 70 |
| 2/11/21 | 70.58 |
| 2/12/21 | 70.25 |
| 2/15/21 | 70.66 |
| 2/16/21 | 71 |
| 2/17/21 | 70.96 |
| 2/18/21 | 70.93 |
| 2/19/21 | 71.68 |
| 2/22/21 | 70.9 |
| 2/23/21 | 69.07 |
| 2/24/21 | 70.35 |
| 2/25/21 | 71.2 |
| 2/26/21 | 71.4 |
| 3/1/21 | 72.2 |
| 3/2/21 | 72.46 |
| 3/3/21 | 75.62 |
| 3/4/21 | 75.28 |
| 3/5/21 | 76.18 |
| 3/8/21 | 79.63 |
| 3/9/21 | 79.7 |
| 3/10/21 | 81.22 |
| 3/11/21 | 77.81 |
| 3/12/21 | 77.79 |
| 3/15/21 | 77.74 |
| 3/16/21 | 80.38 |
| 3/17/21 | 85.89 |
| 3/18/21 | 84.8 |
| 3/19/21 | 83.16 |
| 3/22/21 | 84.81 |
| 3/23/21 | 83.75 |
| 3/24/21 | 82.51 |
| 3/25/21 | 83.47 |
| 3/26/21 | 83.93 |
| 3/29/21 | 85.85 |
| 3/30/21 | 87.89 |
| 3/31/21 | 88.5 |
| 4/1/21 | 88.3 |
| 4/6/21 | 89.42 |
| 4/7/21 | 88.91 |
| 4/8/21 | 88.8 |
| 4/9/21 | 87.88 |
| 4/12/21 | 89.05 |
| 4/13/21 | 88.7 |
| 4/14/21 | 87.35 |
| 4/15/21 | 87.57 |
| 4/16/21 | 88.28 |
| 4/19/21 | 89.38 |
| 4/20/21 | 86.67 |
| 4/21/21 | 85.34 |
| 4/22/21 | 85.56 |
| 4/23/21 | 86.45 |
| 4/26/21 | 86.66 |
| 4/27/21 | 86.23 |
| 4/28/21 | 86.01 |
| 4/29/21 | 83.75 |
| 4/30/21 | 83.49 |
| 5/3/21 | 84.31 |
| 5/4/21 | 81.81 |
| 5/5/21 | 83.01 |
| 5/6/21 | 83.98 |
| 5/7/21 | 83.55 |
| 5/10/21 | 85 |
| 5/11/21 | 84.4 |
| 5/12/21 | 84.6 |
| 5/13/21 | 81.76 |
| 5/14/21 | 83.6 |
| 5/17/21 | 84.65 |
| 5/18/21 | 84.88 |
| 5/19/21 | 83.65 |
| 5/20/21 | 84.82 |
| 5/21/21 | 85.44 |
| 5/25/21 | 85.83 |
| 5/26/21 | 86.22 |
| 5/27/21 | 87.51 |
| 5/28/21 | 87.35 |
| 5/31/21 | 86.98 |
| 6/1/21 | 89.26 |
| 6/2/21 | 89.97 |
| 6/3/21 | 93.63 |
| 6/4/21 | 94.25 |
| 6/7/21 | 95.99 |
| 6/8/21 | 95.7 |
| 6/9/21 | 94.43 |
| 6/10/21 | 92.7 |
| 6/11/21 | 94.51 |
| 6/14/21 | 94.92 |
| 6/15/21 | 94.53 |
| 6/16/21 | 93.14 |
| 6/17/21 | 93.1 |
| 6/18/21 | 90.62 |
| 6/21/21 | 93.16 |
| 6/22/21 | 92.84 |
| 6/23/21 | 91.5 |
| 6/24/21 | 92.42 |
| 6/25/21 | 92.26 |
| 6/28/21 | 90.58 |
| 6/29/21 | 91.49 |
| 6/30/21 | 89.24 |
| 7/1/21 | 89.82 |
| 7/2/21 | 90.26 |
| 7/5/21 | 89.46 |
| 7/6/21 | 86.31 |
| 7/7/21 | 86.37 |
| 7/8/21 | 84.67 |
| 7/9/21 | 87.81 |
| 7/12/21 | 88.63 |
| 7/13/21 | 88.02 |
| 7/14/21 | 88.32 |
| 7/15/21 | 87.44 |
| 7/16/21 | 85.66 |
| 7/19/21 | 82.54 |
| 7/20/21 | 83.38 |
| 7/21/21 | 84.04 |
| 7/22/21 | 83.63 |
| 7/23/21 | 85.62 |
| 7/26/21 | 85.68 |
| 7/27/21 | 83.7 |
| 7/28/21 | 83.89 |
| 7/29/21 | 84.77 |
| 7/30/21 | 84.04 |
| 8/2/21 | 84.6 |
| 8/3/21 | 81.28 |
| 8/4/21 | 81.61 |
| 8/5/21 | 81.33 |
| 8/6/21 | 82.25 |
| 8/9/21 | 81.58 |
| 8/10/21 | 81.96 |
| 8/11/21 | 82.45 |
| 8/12/21 | 83.25 |
| 8/13/21 | 82.91 |
| 8/16/21 | 81.64 |
| 8/17/21 | 80.36 |
| 8/18/21 | 79.99 |
| 8/19/21 | 77.4 |
| 8/20/21 | 76.92 |
| 8/23/21 | 76.9 |
| 8/24/21 | 78.54 |
| 8/25/21 | 78.11 |
| 8/26/21 | 78.03 |
| 8/27/21 | 78.44 |
| 8/30/21 | 79.19 |
| 8/31/21 | 80.57 |
| 9/1/21 | 79.62 |
| 9/2/21 | 79.28 |
| 9/3/21 | 79.49 |
| 9/6/21 | 79.98 |
| 9/7/21 | 80.63 |
| 9/8/21 | 78.71 |
| 9/9/21 | 78.79 |
| 9/10/21 | 79.4 |
| 9/13/21 | 81.77 |
| 9/14/21 | 82.27 |
| 9/15/21 | 82.74 |
| 9/16/21 | 82.27 |
| 9/17/21 | 80.46 |
| 9/20/21 | 77.83 |
| 9/21/21 | 78.9 |
| 9/22/21 | 81.62 |
| 9/23/21 | 81.53 |
| 9/24/21 | 81.51 |
| 9/27/21 | 82.84 |
| 9/28/21 | 82.34 |
| 9/29/21 | 84.5 |
| 9/30/21 | 84.5 |
| 10/1/21 | 84.04 |
| 10/4/21 | 83.3 |
| 10/5/21 | 83.56 |
| 10/6/21 | 81.68 |
| 10/7/21 | 83.35 |
| 10/8/21 | 84.49 |
| 10/11/21 | 86.4 |
| 10/12/21 | 86.45 |
| 10/13/21 | 86.15 |
| 10/14/21 | 86.28 |
| 10/15/21 | 87.43 |
| 10/18/21 | 86.17 |
| 10/19/21 | 85.32 |
| 10/20/21 | 84.79 |
| 10/21/21 | 84.13 |
| 10/22/21 | 85.85 |
| 10/25/21 | 87.32 |
| 10/26/21 | 88.22 |
| 10/27/21 | 88.72 |
| 10/28/21 | 87.26 |
| 10/29/21 | 87.58 |
| 11/1/21 | 88.4 |
| 11/2/21 | 88.77 |
| 11/3/21 | 89.82 |
| 11/4/21 | 90.13 |
| 11/5/21 | 91.52 |
| 11/8/21 | 90.83 |
| 11/9/21 | 90.87 |
| 11/10/21 | 91.83 |
| 11/11/21 | 91.99 |
| 11/12/21 | 92.86 |
| 11/15/21 | 93.34 |
| 11/16/21 | 93.57 |
| 11/17/21 | 93.71 |
| 11/18/21 | 94.15 |
| 11/19/21 | 92.79 |
| 11/22/21 | 94.6 |
| 11/23/21 | 94.6 |
| 11/24/21 | 92.69 |
| 11/25/21 | 91.01 |
| 11/26/21 | 85.76 |
| 11/29/21 | 86 |
| 11/30/21 | 85.21 |
| 12/1/21 | 87.4 |
| 12/2/21 | 88.49 |
| 12/3/21 | 87.59 |
| 12/6/21 | 88.24 |
| 12/7/21 | 90.7 |
| 12/8/21 | 90.45 |
| 12/9/21 | 90.38 |
| 12/10/21 | 89.86 |
| 12/13/21 | 89.8 |
| 12/14/21 | 88.19 |
| 12/15/21 | 89.06 |
| 12/16/21 | 89.71 |
| 12/17/21 | 86.9 |
| 12/20/21 | 85.11 |
| 12/21/21 | 86.38 |
| 12/22/21 | 87.45 |
| 12/23/21 | 89.05 |
| 12/27/21 | 89.9 |
| 12/28/21 | 89.66 |
| 12/29/21 | 89.3 |
| 12/30/21 | 88.39 |
| 1/3/22 | 91.49 |
| 1/4/22 | 93.98 |
| 1/5/22 | 94.98 |
| 1/6/22 | 96 |
| 1/7/22 | 95.76 |
| 1/10/22 | 97.61 |
| 1/11/22 | 98.25 |
| 1/12/22 | 97.43 |
| 1/13/22 | 98.18 |
| 1/14/22 | 99.65 |
| 1/17/22 | 98.88 |
| 1/18/22 | 99 |
| 1/19/22 | 97.72 |
| 1/20/22 | 96.75 |
| 1/21/22 | 95.03 |
| 1/24/22 | 91.83 |
| 1/25/22 | 92.75 |
| 1/26/22 | 93.81 |
| 1/27/22 | 93.67 |
| 1/28/22 | 92.35 |
| 1/31/22 | 93.03 |
| 2/1/22 | 93.99 |
| 2/2/22 | 93.84 |
| 2/3/22 | 93.56 |
| 2/4/22 | 90.42 |
| 2/7/22 | 89.92 |
| 2/8/22 | 90.44 |
| 2/9/22 | 93.41 |
| 2/10/22 | 91.6 |
| 2/11/22 | 94.7 |
| 2/14/22 | 91.58 |
| 2/15/22 | 95.01 |
| 2/16/22 | 93.85 |
| 2/17/22 | 94.99 |
| 2/18/22 | 95.01 |
| 2/21/22 | 89.57 |
| 2/22/22 | 88.99 |
| 2/23/22 | 91.56 |
| 2/24/22 | 85.08 |
| 2/25/22 | 88.27 |
| 2/28/22 | 84.94 |
| 3/1/22 | 81.84 |
| 3/2/22 | 80.8 |
| 3/3/22 | 77.19 |
| 3/4/22 | 73.24 |
| 3/7/22 | 68.92 |
| 3/8/22 | 74.32 |
| 3/9/22 | 76.65 |
| 3/10/22 | 73.17 |
| 3/11/22 | 73.07 |
| 3/14/22 | 74.39 |
| 3/15/22 | 75.47 |
| 3/16/22 | 79 |
| 3/17/22 | 76.93 |
| 3/18/22 | 76.68 |
| 3/21/22 | 77.41 |
| 3/22/22 | 79.48 |
| 3/23/22 | 78.1 |
| 3/24/22 | 78.66 |
| 3/25/22 | 78.62 |
| 3/28/22 | 79.3 |
| 3/29/22 | 82.81 |
| 3/30/22 | 80.8 |
| 3/31/22 | 78.89 |
| 4/1/22 | 78.78 |
| 4/4/22 | 80.28 |
| 4/5/22 | 78.4 |
| 4/6/22 | 76.54 |
| 4/7/22 | 76.42 |
| 4/8/22 | 77.02 |
| 4/11/22 | 76.3 |
| 4/12/22 | 76.03 |
| 4/13/22 | 76.2 |
| 4/14/22 | 76.28 |
| 4/19/22 | 78.29 |
| 4/20/22 | 79.75 |
| 4/21/22 | 79.24 |
| 4/22/22 | 78.76 |
| 4/25/22 | 78.4 |
| 4/26/22 | 76.4 |
| 4/27/22 | 76.75 |
| 4/28/22 | 78.38 |
| 4/29/22 | 78.03 |
| 5/2/22 | 77.7 |
| 5/3/22 | 80 |
| 5/4/22 | 80.66 |
| 5/5/22 | 78.26 |
| 5/6/22 | 79 |
| 5/9/22 | 78.31 |
| 5/10/22 | 79.14 |
| 5/11/22 | 82 |
| 5/12/22 | 76.05 |
| 5/13/22 | 77.62 |
| 5/16/22 | 77.7 |
| 5/17/22 | 78.79 |
| 5/18/22 | 77.77 |
| 5/19/22 | 78.18 |
| 5/20/22 | 77.33 |
| 5/23/22 | 78.25 |
| 5/24/22 | 78.14 |
| 5/25/22 | 78.66 |
| 5/26/22 | 80 |
| 5/27/22 | 80.41 |
| 5/30/22 | 81.48 |
| 5/31/22 | 80.86 |
| 6/1/22 | 82.4 |
| 6/2/22 | 84 |
| 6/3/22 | 83.42 |
| 6/6/22 | 83.09 |
| 6/7/22 | 82 |
| 6/8/22 | 83.26 |
| 6/9/22 | 81.7 |
| 6/10/22 | 80.73 |
| 6/13/22 | 77.56 |
| 6/14/22 | 77.47 |
| 6/15/22 | 79.56 |
| 6/16/22 | 77.3 |
| 6/17/22 | 77.45 |
| 6/20/22 | 78.72 |
| 6/21/22 | 79.4 |
| 6/22/22 | 78.1 |
| 6/23/22 | 75.41 |
| 6/24/22 | 75.05 |
| 6/27/22 | 75.74 |
| 6/28/22 | 76.06 |
| 6/29/22 | 74.63 |
| 6/30/22 | 73.8 |
| 7/1/22 | 73.92 |
| 7/4/22 | 72.87 |
| 7/5/22 | 71.5 |
| 7/6/22 | 71.56 |
| 7/7/22 | 74.63 |
| 7/8/22 | 75.79 |
| 7/11/22 | 73.82 |
| 7/12/22 | 74.52 |
| 7/13/22 | 73.03 |
| 7/14/22 | 72.56 |
| 7/15/22 | 74.89 |
| 7/18/22 | 75.3 |
| 7/19/22 | 78.07 |
| 7/20/22 | 77.2 |
| 7/21/22 | 76.9 |
| 7/22/22 | 76.6 |
| 7/25/22 | 77.65 |
| 7/26/22 | 75.7 |
| 7/27/22 | 76.87 |
| 7/28/22 | 78.25 |
| 7/29/22 | 79.26 |
| 8/1/22 | 79.84 |
| 8/2/22 | 80.96 |
| 8/3/22 | 76.9 |
| 8/4/22 | 76.29 |
| 8/5/22 | 76.6 |
| 8/8/22 | 77.8 |
| 8/9/22 | 76.92 |
| 8/10/22 | 78.08 |
| 8/11/22 | 77.82 |
| 8/12/22 | 78.01 |
| 8/15/22 | 78.33 |
| 8/16/22 | 79.08 |
| 8/17/22 | 77.3 |
| 8/18/22 | 77.81 |
| 8/19/22 | 75.9 |
| 8/22/22 | 73.09 |
| 8/23/22 | 74.84 |
| 8/24/22 | 74.63 |
| 8/25/22 | 74.37 |
| 8/26/22 | 72.75 |
| 8/29/22 | 73.59 |
| 8/30/22 | 73.6 |
| 8/31/22 | 73.5 |
| 9/1/22 | 73.35 |
| 9/2/22 | 73.92 |
| 9/5/22 | 72.62 |
| 9/6/22 | 72.86 |
| 9/7/22 | 73.92 |
| 9/8/22 | 72.25 |
| 9/9/22 | 73.67 |
| 9/12/22 | 75.89 |
| 9/13/22 | 74.5 |
| 9/14/22 | 74.79 |
| 9/15/22 | 74.64 |
| 9/16/22 | 74.14 |
| 9/19/22 | 74.85 |
| 9/20/22 | 75.01 |
| 9/21/22 | 74.5 |
| 9/22/22 | 74.8 |
| 9/23/22 | 71.56 |
| 9/26/22 | 71.92 |
| 9/27/22 | 71.29 |
| 9/28/22 | 72.24 |
| 9/29/22 | 69 |
| 9/30/22 | 69.71 |
| 10/3/22 | 70.75 |
| 10/4/22 | 72.94 |
| 10/5/22 | 71.79 |
| 10/6/22 | 72.12 |
| 10/7/22 | 71.5 |
| 10/10/22 | 72.7 |
| 10/11/22 | 72.54 |
| 10/12/22 | 73.05 |
| 10/13/22 | 74.35 |
| 10/14/22 | 74.81 |
| 10/17/22 | 76.39 |
| 10/18/22 | 77.83 |
| 10/19/22 | 77.12 |
| 10/20/22 | 77.93 |
| 10/21/22 | 77.6 |
| 10/24/22 | 78 |
| 10/25/22 | 77.35 |
| 10/26/22 | 79 |
| 10/27/22 | 79.8 |
| 10/28/22 | 79.99 |
| 10/31/22 | 79.53 |
| 11/1/22 | 80.57 |
| 11/2/22 | 79.77 |
| 11/3/22 | 76.6 |
| 11/4/22 | 79.5 |
| 11/7/22 | 80.68 |
| 11/8/22 | 80.79 |
| 11/9/22 | 79.9 |
| 11/10/22 | 82.66 |
| 11/11/22 | 84.5 |
| 11/14/22 | 84.7 |
| 11/15/22 | 84.47 |
| 11/16/22 | 82.7 |
| 11/17/22 | 82.27 |
| 11/18/22 | 84.03 |
| 11/21/22 | 83.5 |
| 11/22/22 | 84.04 |
| 11/23/22 | 83.87 |
| 11/24/22 | 84.16 |
| 11/25/22 | 83.91 |
| 11/28/22 | 83.73 |
| 11/29/22 | 84.63 |
| 11/30/22 | 86 |
| 12/1/22 | 85.4 |
| 12/2/22 | 85.44 |
| 12/5/22 | 86 |
| 12/6/22 | 85.24 |
| 12/7/22 | 84.85 |
| 12/8/22 | 82.84 |
| 12/9/22 | 84.51 |
| 12/12/22 | 84.54 |
| 12/13/22 | 84.18 |
| 12/14/22 | 83.58 |
| 12/15/22 | 82.8 |
| 12/16/22 | 82.65 |
| 12/19/22 | 83.7 |
| 12/20/22 | 83.75 |
| 12/21/22 | 84.04 |
| 12/22/22 | 83.29 |
| 12/23/22 | 83.65 |
| 12/27/22 | 83.86 |
| 12/28/22 | 83.28 |
| 12/29/22 | 84.05 |
| 12/30/22 | 83.37 |
| 1/2/23 | 85.8 |
| 1/3/23 | 85.73 |
| 1/4/23 | 87.84 |
| 1/5/23 | 89.15 |
| 1/6/23 | 89.5 |
| 1/9/23 | 90 |
| 1/10/23 | 90.64 |
| 1/11/23 | 91.79 |
| 1/12/23 | 93.12 |
| 1/13/23 | 91.79 |
| 1/16/23 | 91.7 |
| 1/17/23 | 91.69 |
| 1/18/23 | 91.2 |
| 1/19/23 | 90.09 |
| 1/20/23 | 89.81 |
| 1/23/23 | 91.72 |
| 1/24/23 | 92.01 |
| 1/25/23 | 91.68 |
| 1/26/23 | 92.51 |
| 1/27/23 | 92.89 |
| 1/30/23 | 91.53 |
| 1/31/23 | 92.8 |
| 2/1/23 | 95.77 |
| 2/2/23 | 97.32 |
| 2/3/23 | 97.69 |
| 2/6/23 | 97.22 |
| 2/7/23 | 97.5 |
| 2/8/23 | 97.44 |
| 2/9/23 | 98.42 |
| 2/10/23 | 97.85 |
| 2/13/23 | 98.05 |
| 2/14/23 | 97.92 |
| 2/15/23 | 99.15 |
| 2/16/23 | 99.61 |
| 2/17/23 | 99.65 |
| 2/20/23 | 99.79 |
| 2/21/23 | 98.88 |
| 2/22/23 | 98.28 |
| 2/23/23 | 99.42 |
| 2/24/23 | 97.43 |
| 2/27/23 | 98.53 |
| 2/28/23 | 98.15 |
| 3/1/23 | 99.6 |
| 3/2/23 | 99.6 |
| 3/3/23 | 101.28 |
| 3/6/23 | 101.12 |
| 3/7/23 | 100.94 |
| 3/8/23 | 101.22 |
| 3/9/23 | 99.2 |
| 3/10/23 | 97.25 |
| 3/13/23 | 94.9 |
| 3/14/23 | 95.51 |
| 3/15/23 | 95.61 |
| 3/16/23 | 96.19 |
| 3/17/23 | 94.99 |
| 3/20/23 | 95.95 |
| 3/21/23 | 97.8 |
| 3/22/23 | 98.36 |
| 3/23/23 | 98.8 |
| 3/24/23 | 98.1 |
| 3/27/23 | 99.08 |
| 3/28/23 | 98.42 |
| 3/29/23 | 98.94 |
| 3/30/23 | 100.54 |
| 3/31/23 | 101.12 |
| 4/3/23 | 101.1 |
| 4/4/23 | 101.44 |
| 4/5/23 | 99.35 |
| 4/6/23 | 99.09 |
| 4/11/23 | 101.04 |
| 4/12/23 | 102.86 |
| 4/13/23 | 102.82 |
| 4/14/23 | 103.46 |
| 4/17/23 | 103.48 |
| 4/18/23 | 104.32 |
| 4/19/23 | 103.6 |
| 4/20/23 | 101.22 |
| 4/21/23 | 100.8 |
| 4/24/23 | 101.6 |
| 4/25/23 | 101.02 |
| 4/26/23 | 100.84 |
| 4/27/23 | 101 |
| 4/28/23 | 101.96 |
| 5/2/23 | 100.66 |
| 5/3/23 | 101.54 |
| 5/4/23 | 103.76 |
| 5/5/23 | 107.4 |
| 5/8/23 | 109.02 |
| 5/9/23 | 109.06 |
| 5/10/23 | 109 |
| 5/11/23 | 108.72 |
| 5/12/23 | 99.8 |
| 5/15/23 | 100.48 |
| 5/16/23 | 99.51 |
| 5/17/23 | 100.4 |
| 5/18/23 | 102.58 |
| 5/19/23 | 103.04 |
| 5/22/23 | 104.08 |
| 5/23/23 | 103.74 |
| 5/24/23 | 102.54 |
| 5/25/23 | 102.98 |
| 5/26/23 | 104.3 |
| 5/29/23 | 104.22 |
| 5/30/23 | 103.74 |
| 5/31/23 | 102.12 |
| 6/1/23 | 103.38 |
| 6/2/23 | 105.8 |
| 6/5/23 | 106.26 |
| 6/6/23 | 106.4 |
| 6/7/23 | 106.6 |
| 6/8/23 | 107.74 |
| 6/9/23 | 108.4 |
| 6/12/23 | 109.72 |
| 6/13/23 | 111.58 |
| 6/14/23 | 112.52 |
| 6/15/23 | 112.3 |
| 6/16/23 | 111.12 |
| 6/19/23 | 110.92 |
| 6/20/23 | 110.82 |
| 6/21/23 | 110.22 |
| 6/22/23 | 108.92 |
| 6/23/23 | 108.6 |
| 6/26/23 | 109.18 |
| 6/27/23 | 107.92 |
| 6/28/23 | 109.36 |
| 6/29/23 | 111.26 |
| 6/30/23 | 112.3 |
| 7/3/23 | 112.06 |
| 7/4/23 | 111.66 |
| 7/5/23 | 112.08 |
| 7/6/23 | 108.56 |
| 7/7/23 | 107.74 |
| 7/10/23 | 107.78 |
| 7/11/23 | 106.36 |
| 7/12/23 | 107.12 |
| 7/13/23 | 106.9 |
| 7/14/23 | 106.48 |
| 7/17/23 | 106.88 |
| 7/18/23 | 106.86 |
| 7/19/23 | 106.84 |
| 7/20/23 | 107.16 |
| 7/21/23 | 107.76 |
| 7/24/23 | 108.2 |
| 7/25/23 | 108.66 |
| 7/26/23 | 107.4 |
| 7/27/23 | 109.56 |
| 7/28/23 | 110.64 |
| 7/31/23 | 110.34 |
| 8/1/23 | 105.14 |
| 8/2/23 | 104.88 |
| 8/3/23 | 102.66 |
| 8/4/23 | 103.34 |
| 8/7/23 | 103.68 |
| 8/8/23 | 102.2 |
| 8/9/23 | 102.04 |
| 8/10/23 | 102.08 |
| 8/11/23 | 100.24 |
| 8/14/23 | 99.98 |
| 8/15/23 | 99.1 |
| 8/16/23 | 99.59 |
| 8/17/23 | 99.2 |
| 8/18/23 | 98.4 |
| 8/21/23 | 99.27 |
| 8/22/23 | 99.82 |
| 8/23/23 | 98.33 |
| 8/24/23 | 96.82 |
| 8/25/23 | 96.34 |
| 8/28/23 | 96.31 |
| 8/29/23 | 97.78 |
| 8/30/23 | 96.81 |
| 8/31/23 | 97 |
| 9/1/23 | 94.38 |
| 9/4/23 | 94.41 |
| 9/5/23 | 97 |
| 9/6/23 | 96.39 |
| 9/7/23 | 95.29 |
| 9/8/23 | 95.41 |
| 9/11/23 | 96.47 |
| 9/12/23 | 96.5 |
| 9/13/23 | 96 |
| 9/14/23 | 96.01 |
| 9/15/23 | 97.24 |
| 9/18/23 | 96.56 |
| 9/19/23 | 97.77 |
| 9/20/23 | 100.2 |
| 9/21/23 | 99.7 |
| 9/22/23 | 99.53 |
| 9/25/23 | 97.48 |
| 9/26/23 | 95.59 |
| 9/27/23 | 96.86 |
| 9/28/23 | 97.44 |
| 9/29/23 | 96.46 |
| 10/2/23 | 95.81 |
| 10/3/23 | 95.62 |
| 10/4/23 | 95.64 |
| 10/5/23 | 94.52 |
| 10/6/23 | 95.7 |
| 10/9/23 | 94.62 |
| 10/10/23 | 97.3 |
| 10/11/23 | 98.5 |
| 10/12/23 | 98.1 |
| 10/13/23 | 97.58 |
| 10/16/23 | 98.5 |
| 10/17/23 | 98.47 |
| 10/18/23 | 98.07 |
| 10/19/23 | 95.1 |
| 10/20/23 | 93.8 |
| 10/23/23 | 93.56 |
| 10/24/23 | 92.8 |
| 10/25/23 | 91.23 |
| 10/26/23 | 88.68 |
| 10/27/23 | 88.43 |